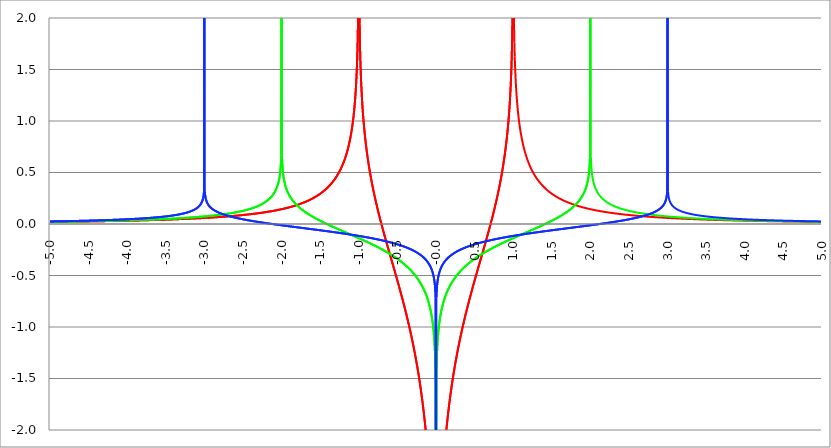
| Category | Series 1 | Series 0 | Series 2 |
|---|---|---|---|
| -5.0 | 0.02 | 0.022 | 0.025 |
| -4.995 | 0.02 | 0.022 | 0.025 |
| -4.99 | 0.02 | 0.022 | 0.025 |
| -4.985 | 0.021 | 0.022 | 0.025 |
| -4.98 | 0.021 | 0.022 | 0.025 |
| -4.975 | 0.021 | 0.022 | 0.025 |
| -4.97 | 0.021 | 0.022 | 0.025 |
| -4.965000000000001 | 0.021 | 0.022 | 0.025 |
| -4.960000000000001 | 0.021 | 0.022 | 0.025 |
| -4.955000000000001 | 0.021 | 0.022 | 0.025 |
| -4.950000000000001 | 0.021 | 0.022 | 0.025 |
| -4.945000000000001 | 0.021 | 0.022 | 0.025 |
| -4.940000000000001 | 0.021 | 0.022 | 0.026 |
| -4.935000000000001 | 0.021 | 0.022 | 0.026 |
| -4.930000000000001 | 0.021 | 0.022 | 0.026 |
| -4.925000000000002 | 0.021 | 0.023 | 0.026 |
| -4.920000000000002 | 0.021 | 0.023 | 0.026 |
| -4.915000000000002 | 0.021 | 0.023 | 0.026 |
| -4.910000000000002 | 0.021 | 0.023 | 0.026 |
| -4.905000000000002 | 0.021 | 0.023 | 0.026 |
| -4.900000000000002 | 0.021 | 0.023 | 0.026 |
| -4.895000000000002 | 0.021 | 0.023 | 0.026 |
| -4.890000000000002 | 0.021 | 0.023 | 0.026 |
| -4.885000000000002 | 0.021 | 0.023 | 0.026 |
| -4.880000000000002 | 0.021 | 0.023 | 0.026 |
| -4.875000000000003 | 0.021 | 0.023 | 0.026 |
| -4.870000000000003 | 0.022 | 0.023 | 0.027 |
| -4.865000000000003 | 0.022 | 0.023 | 0.027 |
| -4.860000000000003 | 0.022 | 0.023 | 0.027 |
| -4.855000000000003 | 0.022 | 0.023 | 0.027 |
| -4.850000000000003 | 0.022 | 0.023 | 0.027 |
| -4.845000000000003 | 0.022 | 0.023 | 0.027 |
| -4.840000000000003 | 0.022 | 0.023 | 0.027 |
| -4.835000000000003 | 0.022 | 0.023 | 0.027 |
| -4.830000000000004 | 0.022 | 0.024 | 0.027 |
| -4.825000000000004 | 0.022 | 0.024 | 0.027 |
| -4.820000000000004 | 0.022 | 0.024 | 0.027 |
| -4.815000000000004 | 0.022 | 0.024 | 0.027 |
| -4.810000000000004 | 0.022 | 0.024 | 0.027 |
| -4.805000000000004 | 0.022 | 0.024 | 0.027 |
| -4.800000000000004 | 0.022 | 0.024 | 0.028 |
| -4.795000000000004 | 0.022 | 0.024 | 0.028 |
| -4.790000000000004 | 0.022 | 0.024 | 0.028 |
| -4.785000000000004 | 0.022 | 0.024 | 0.028 |
| -4.780000000000004 | 0.022 | 0.024 | 0.028 |
| -4.775000000000004 | 0.022 | 0.024 | 0.028 |
| -4.770000000000004 | 0.022 | 0.024 | 0.028 |
| -4.765000000000005 | 0.023 | 0.024 | 0.028 |
| -4.760000000000005 | 0.023 | 0.024 | 0.028 |
| -4.755000000000005 | 0.023 | 0.024 | 0.028 |
| -4.750000000000005 | 0.023 | 0.024 | 0.028 |
| -4.745000000000005 | 0.023 | 0.024 | 0.028 |
| -4.740000000000005 | 0.023 | 0.025 | 0.028 |
| -4.735000000000005 | 0.023 | 0.025 | 0.029 |
| -4.730000000000005 | 0.023 | 0.025 | 0.029 |
| -4.725000000000006 | 0.023 | 0.025 | 0.029 |
| -4.720000000000006 | 0.023 | 0.025 | 0.029 |
| -4.715000000000006 | 0.023 | 0.025 | 0.029 |
| -4.710000000000006 | 0.023 | 0.025 | 0.029 |
| -4.705000000000006 | 0.023 | 0.025 | 0.029 |
| -4.700000000000006 | 0.023 | 0.025 | 0.029 |
| -4.695000000000006 | 0.023 | 0.025 | 0.029 |
| -4.690000000000006 | 0.023 | 0.025 | 0.029 |
| -4.685000000000007 | 0.023 | 0.025 | 0.029 |
| -4.680000000000007 | 0.023 | 0.025 | 0.029 |
| -4.675000000000007 | 0.023 | 0.025 | 0.029 |
| -4.670000000000007 | 0.023 | 0.025 | 0.03 |
| -4.665000000000007 | 0.024 | 0.025 | 0.03 |
| -4.660000000000007 | 0.024 | 0.025 | 0.03 |
| -4.655000000000007 | 0.024 | 0.026 | 0.03 |
| -4.650000000000007 | 0.024 | 0.026 | 0.03 |
| -4.645000000000007 | 0.024 | 0.026 | 0.03 |
| -4.640000000000008 | 0.024 | 0.026 | 0.03 |
| -4.635000000000008 | 0.024 | 0.026 | 0.03 |
| -4.630000000000008 | 0.024 | 0.026 | 0.03 |
| -4.625000000000008 | 0.024 | 0.026 | 0.03 |
| -4.620000000000008 | 0.024 | 0.026 | 0.03 |
| -4.615000000000008 | 0.024 | 0.026 | 0.031 |
| -4.610000000000008 | 0.024 | 0.026 | 0.031 |
| -4.605000000000008 | 0.024 | 0.026 | 0.031 |
| -4.600000000000008 | 0.024 | 0.026 | 0.031 |
| -4.595000000000009 | 0.024 | 0.026 | 0.031 |
| -4.590000000000009 | 0.024 | 0.026 | 0.031 |
| -4.585000000000009 | 0.024 | 0.026 | 0.031 |
| -4.580000000000009 | 0.024 | 0.026 | 0.031 |
| -4.57500000000001 | 0.024 | 0.027 | 0.031 |
| -4.57000000000001 | 0.025 | 0.027 | 0.031 |
| -4.565000000000009 | 0.025 | 0.027 | 0.031 |
| -4.560000000000009 | 0.025 | 0.027 | 0.032 |
| -4.555000000000009 | 0.025 | 0.027 | 0.032 |
| -4.55000000000001 | 0.025 | 0.027 | 0.032 |
| -4.54500000000001 | 0.025 | 0.027 | 0.032 |
| -4.54000000000001 | 0.025 | 0.027 | 0.032 |
| -4.53500000000001 | 0.025 | 0.027 | 0.032 |
| -4.53000000000001 | 0.025 | 0.027 | 0.032 |
| -4.52500000000001 | 0.025 | 0.027 | 0.032 |
| -4.52000000000001 | 0.025 | 0.027 | 0.032 |
| -4.51500000000001 | 0.025 | 0.027 | 0.032 |
| -4.51000000000001 | 0.025 | 0.027 | 0.032 |
| -4.505000000000011 | 0.025 | 0.027 | 0.033 |
| -4.500000000000011 | 0.025 | 0.028 | 0.033 |
| -4.495000000000011 | 0.025 | 0.028 | 0.033 |
| -4.490000000000011 | 0.025 | 0.028 | 0.033 |
| -4.485000000000011 | 0.025 | 0.028 | 0.033 |
| -4.480000000000011 | 0.026 | 0.028 | 0.033 |
| -4.475000000000011 | 0.026 | 0.028 | 0.033 |
| -4.470000000000011 | 0.026 | 0.028 | 0.033 |
| -4.465000000000011 | 0.026 | 0.028 | 0.033 |
| -4.460000000000011 | 0.026 | 0.028 | 0.033 |
| -4.455000000000012 | 0.026 | 0.028 | 0.034 |
| -4.450000000000012 | 0.026 | 0.028 | 0.034 |
| -4.445000000000012 | 0.026 | 0.028 | 0.034 |
| -4.440000000000012 | 0.026 | 0.028 | 0.034 |
| -4.435000000000012 | 0.026 | 0.028 | 0.034 |
| -4.430000000000012 | 0.026 | 0.028 | 0.034 |
| -4.425000000000012 | 0.026 | 0.029 | 0.034 |
| -4.420000000000012 | 0.026 | 0.029 | 0.034 |
| -4.415000000000012 | 0.026 | 0.029 | 0.034 |
| -4.410000000000013 | 0.026 | 0.029 | 0.035 |
| -4.405000000000013 | 0.026 | 0.029 | 0.035 |
| -4.400000000000013 | 0.027 | 0.029 | 0.035 |
| -4.395000000000013 | 0.027 | 0.029 | 0.035 |
| -4.390000000000013 | 0.027 | 0.029 | 0.035 |
| -4.385000000000013 | 0.027 | 0.029 | 0.035 |
| -4.380000000000013 | 0.027 | 0.029 | 0.035 |
| -4.375000000000013 | 0.027 | 0.029 | 0.035 |
| -4.370000000000013 | 0.027 | 0.029 | 0.035 |
| -4.365000000000013 | 0.027 | 0.029 | 0.036 |
| -4.360000000000014 | 0.027 | 0.03 | 0.036 |
| -4.355000000000014 | 0.027 | 0.03 | 0.036 |
| -4.350000000000014 | 0.027 | 0.03 | 0.036 |
| -4.345000000000014 | 0.027 | 0.03 | 0.036 |
| -4.340000000000014 | 0.027 | 0.03 | 0.036 |
| -4.335000000000014 | 0.027 | 0.03 | 0.036 |
| -4.330000000000014 | 0.027 | 0.03 | 0.036 |
| -4.325000000000014 | 0.027 | 0.03 | 0.036 |
| -4.320000000000014 | 0.028 | 0.03 | 0.037 |
| -4.315000000000015 | 0.028 | 0.03 | 0.037 |
| -4.310000000000015 | 0.028 | 0.03 | 0.037 |
| -4.305000000000015 | 0.028 | 0.03 | 0.037 |
| -4.300000000000015 | 0.028 | 0.03 | 0.037 |
| -4.295000000000015 | 0.028 | 0.031 | 0.037 |
| -4.290000000000015 | 0.028 | 0.031 | 0.037 |
| -4.285000000000015 | 0.028 | 0.031 | 0.037 |
| -4.280000000000015 | 0.028 | 0.031 | 0.038 |
| -4.275000000000015 | 0.028 | 0.031 | 0.038 |
| -4.270000000000015 | 0.028 | 0.031 | 0.038 |
| -4.265000000000016 | 0.028 | 0.031 | 0.038 |
| -4.260000000000016 | 0.028 | 0.031 | 0.038 |
| -4.255000000000016 | 0.028 | 0.031 | 0.038 |
| -4.250000000000016 | 0.028 | 0.031 | 0.038 |
| -4.245000000000016 | 0.029 | 0.031 | 0.038 |
| -4.240000000000016 | 0.029 | 0.031 | 0.039 |
| -4.235000000000016 | 0.029 | 0.032 | 0.039 |
| -4.230000000000016 | 0.029 | 0.032 | 0.039 |
| -4.225000000000017 | 0.029 | 0.032 | 0.039 |
| -4.220000000000017 | 0.029 | 0.032 | 0.039 |
| -4.215000000000017 | 0.029 | 0.032 | 0.039 |
| -4.210000000000017 | 0.029 | 0.032 | 0.039 |
| -4.205000000000017 | 0.029 | 0.032 | 0.04 |
| -4.200000000000017 | 0.029 | 0.032 | 0.04 |
| -4.195000000000017 | 0.029 | 0.032 | 0.04 |
| -4.190000000000017 | 0.029 | 0.032 | 0.04 |
| -4.185000000000017 | 0.029 | 0.032 | 0.04 |
| -4.180000000000017 | 0.029 | 0.032 | 0.04 |
| -4.175000000000018 | 0.03 | 0.033 | 0.04 |
| -4.170000000000018 | 0.03 | 0.033 | 0.04 |
| -4.165000000000018 | 0.03 | 0.033 | 0.041 |
| -4.160000000000018 | 0.03 | 0.033 | 0.041 |
| -4.155000000000018 | 0.03 | 0.033 | 0.041 |
| -4.150000000000018 | 0.03 | 0.033 | 0.041 |
| -4.145000000000018 | 0.03 | 0.033 | 0.041 |
| -4.140000000000018 | 0.03 | 0.033 | 0.041 |
| -4.135000000000018 | 0.03 | 0.033 | 0.042 |
| -4.130000000000019 | 0.03 | 0.033 | 0.042 |
| -4.125000000000019 | 0.03 | 0.033 | 0.042 |
| -4.120000000000019 | 0.03 | 0.034 | 0.042 |
| -4.115000000000019 | 0.03 | 0.034 | 0.042 |
| -4.110000000000019 | 0.031 | 0.034 | 0.042 |
| -4.105000000000019 | 0.031 | 0.034 | 0.042 |
| -4.100000000000019 | 0.031 | 0.034 | 0.043 |
| -4.095000000000019 | 0.031 | 0.034 | 0.043 |
| -4.090000000000019 | 0.031 | 0.034 | 0.043 |
| -4.085000000000019 | 0.031 | 0.034 | 0.043 |
| -4.08000000000002 | 0.031 | 0.034 | 0.043 |
| -4.07500000000002 | 0.031 | 0.034 | 0.043 |
| -4.07000000000002 | 0.031 | 0.035 | 0.044 |
| -4.06500000000002 | 0.031 | 0.035 | 0.044 |
| -4.06000000000002 | 0.031 | 0.035 | 0.044 |
| -4.05500000000002 | 0.031 | 0.035 | 0.044 |
| -4.05000000000002 | 0.031 | 0.035 | 0.044 |
| -4.04500000000002 | 0.032 | 0.035 | 0.044 |
| -4.04000000000002 | 0.032 | 0.035 | 0.045 |
| -4.03500000000002 | 0.032 | 0.035 | 0.045 |
| -4.03000000000002 | 0.032 | 0.035 | 0.045 |
| -4.025000000000021 | 0.032 | 0.035 | 0.045 |
| -4.020000000000021 | 0.032 | 0.036 | 0.045 |
| -4.015000000000021 | 0.032 | 0.036 | 0.045 |
| -4.010000000000021 | 0.032 | 0.036 | 0.046 |
| -4.005000000000021 | 0.032 | 0.036 | 0.046 |
| -4.000000000000021 | 0.032 | 0.036 | 0.046 |
| -3.995000000000021 | 0.032 | 0.036 | 0.046 |
| -3.990000000000021 | 0.032 | 0.036 | 0.046 |
| -3.985000000000022 | 0.033 | 0.036 | 0.046 |
| -3.980000000000022 | 0.033 | 0.036 | 0.047 |
| -3.975000000000022 | 0.033 | 0.036 | 0.047 |
| -3.970000000000022 | 0.033 | 0.037 | 0.047 |
| -3.965000000000022 | 0.033 | 0.037 | 0.047 |
| -3.960000000000022 | 0.033 | 0.037 | 0.047 |
| -3.955000000000022 | 0.033 | 0.037 | 0.048 |
| -3.950000000000022 | 0.033 | 0.037 | 0.048 |
| -3.945000000000022 | 0.033 | 0.037 | 0.048 |
| -3.940000000000023 | 0.033 | 0.037 | 0.048 |
| -3.935000000000023 | 0.033 | 0.037 | 0.048 |
| -3.930000000000023 | 0.033 | 0.037 | 0.049 |
| -3.925000000000023 | 0.034 | 0.038 | 0.049 |
| -3.920000000000023 | 0.034 | 0.038 | 0.049 |
| -3.915000000000023 | 0.034 | 0.038 | 0.049 |
| -3.910000000000023 | 0.034 | 0.038 | 0.049 |
| -3.905000000000023 | 0.034 | 0.038 | 0.05 |
| -3.900000000000023 | 0.034 | 0.038 | 0.05 |
| -3.895000000000023 | 0.034 | 0.038 | 0.05 |
| -3.890000000000024 | 0.034 | 0.038 | 0.05 |
| -3.885000000000024 | 0.034 | 0.038 | 0.05 |
| -3.880000000000024 | 0.034 | 0.039 | 0.051 |
| -3.875000000000024 | 0.034 | 0.039 | 0.051 |
| -3.870000000000024 | 0.035 | 0.039 | 0.051 |
| -3.865000000000024 | 0.035 | 0.039 | 0.051 |
| -3.860000000000024 | 0.035 | 0.039 | 0.051 |
| -3.855000000000024 | 0.035 | 0.039 | 0.052 |
| -3.850000000000024 | 0.035 | 0.039 | 0.052 |
| -3.845000000000025 | 0.035 | 0.039 | 0.052 |
| -3.840000000000025 | 0.035 | 0.04 | 0.052 |
| -3.835000000000025 | 0.035 | 0.04 | 0.053 |
| -3.830000000000025 | 0.035 | 0.04 | 0.053 |
| -3.825000000000025 | 0.035 | 0.04 | 0.053 |
| -3.820000000000025 | 0.035 | 0.04 | 0.053 |
| -3.815000000000025 | 0.036 | 0.04 | 0.054 |
| -3.810000000000025 | 0.036 | 0.04 | 0.054 |
| -3.805000000000025 | 0.036 | 0.04 | 0.054 |
| -3.800000000000026 | 0.036 | 0.041 | 0.054 |
| -3.795000000000026 | 0.036 | 0.041 | 0.054 |
| -3.790000000000026 | 0.036 | 0.041 | 0.055 |
| -3.785000000000026 | 0.036 | 0.041 | 0.055 |
| -3.780000000000026 | 0.036 | 0.041 | 0.055 |
| -3.775000000000026 | 0.036 | 0.041 | 0.055 |
| -3.770000000000026 | 0.036 | 0.041 | 0.056 |
| -3.765000000000026 | 0.037 | 0.041 | 0.056 |
| -3.760000000000026 | 0.037 | 0.042 | 0.056 |
| -3.755000000000026 | 0.037 | 0.042 | 0.056 |
| -3.750000000000027 | 0.037 | 0.042 | 0.057 |
| -3.745000000000027 | 0.037 | 0.042 | 0.057 |
| -3.740000000000027 | 0.037 | 0.042 | 0.057 |
| -3.735000000000027 | 0.037 | 0.042 | 0.058 |
| -3.730000000000027 | 0.037 | 0.042 | 0.058 |
| -3.725000000000027 | 0.037 | 0.043 | 0.058 |
| -3.720000000000027 | 0.038 | 0.043 | 0.058 |
| -3.715000000000027 | 0.038 | 0.043 | 0.059 |
| -3.710000000000027 | 0.038 | 0.043 | 0.059 |
| -3.705000000000028 | 0.038 | 0.043 | 0.059 |
| -3.700000000000028 | 0.038 | 0.043 | 0.06 |
| -3.695000000000028 | 0.038 | 0.043 | 0.06 |
| -3.690000000000028 | 0.038 | 0.043 | 0.06 |
| -3.685000000000028 | 0.038 | 0.044 | 0.06 |
| -3.680000000000028 | 0.038 | 0.044 | 0.061 |
| -3.675000000000028 | 0.038 | 0.044 | 0.061 |
| -3.670000000000028 | 0.039 | 0.044 | 0.061 |
| -3.665000000000028 | 0.039 | 0.044 | 0.062 |
| -3.660000000000028 | 0.039 | 0.044 | 0.062 |
| -3.655000000000029 | 0.039 | 0.044 | 0.062 |
| -3.650000000000029 | 0.039 | 0.045 | 0.063 |
| -3.645000000000029 | 0.039 | 0.045 | 0.063 |
| -3.640000000000029 | 0.039 | 0.045 | 0.063 |
| -3.635000000000029 | 0.039 | 0.045 | 0.063 |
| -3.630000000000029 | 0.039 | 0.045 | 0.064 |
| -3.625000000000029 | 0.04 | 0.045 | 0.064 |
| -3.620000000000029 | 0.04 | 0.046 | 0.064 |
| -3.615000000000029 | 0.04 | 0.046 | 0.065 |
| -3.61000000000003 | 0.04 | 0.046 | 0.065 |
| -3.60500000000003 | 0.04 | 0.046 | 0.066 |
| -3.60000000000003 | 0.04 | 0.046 | 0.066 |
| -3.59500000000003 | 0.04 | 0.046 | 0.066 |
| -3.59000000000003 | 0.04 | 0.046 | 0.067 |
| -3.58500000000003 | 0.041 | 0.047 | 0.067 |
| -3.58000000000003 | 0.041 | 0.047 | 0.067 |
| -3.57500000000003 | 0.041 | 0.047 | 0.068 |
| -3.57000000000003 | 0.041 | 0.047 | 0.068 |
| -3.565000000000031 | 0.041 | 0.047 | 0.068 |
| -3.560000000000031 | 0.041 | 0.047 | 0.069 |
| -3.555000000000031 | 0.041 | 0.048 | 0.069 |
| -3.550000000000031 | 0.041 | 0.048 | 0.07 |
| -3.545000000000031 | 0.041 | 0.048 | 0.07 |
| -3.540000000000031 | 0.042 | 0.048 | 0.07 |
| -3.535000000000031 | 0.042 | 0.048 | 0.071 |
| -3.530000000000031 | 0.042 | 0.048 | 0.071 |
| -3.525000000000031 | 0.042 | 0.049 | 0.072 |
| -3.520000000000032 | 0.042 | 0.049 | 0.072 |
| -3.515000000000032 | 0.042 | 0.049 | 0.072 |
| -3.510000000000032 | 0.042 | 0.049 | 0.073 |
| -3.505000000000032 | 0.042 | 0.049 | 0.073 |
| -3.500000000000032 | 0.043 | 0.049 | 0.074 |
| -3.495000000000032 | 0.043 | 0.05 | 0.074 |
| -3.490000000000032 | 0.043 | 0.05 | 0.075 |
| -3.485000000000032 | 0.043 | 0.05 | 0.075 |
| -3.480000000000032 | 0.043 | 0.05 | 0.076 |
| -3.475000000000032 | 0.043 | 0.05 | 0.076 |
| -3.470000000000033 | 0.043 | 0.05 | 0.076 |
| -3.465000000000033 | 0.043 | 0.051 | 0.077 |
| -3.460000000000033 | 0.044 | 0.051 | 0.077 |
| -3.455000000000033 | 0.044 | 0.051 | 0.078 |
| -3.450000000000033 | 0.044 | 0.051 | 0.078 |
| -3.445000000000033 | 0.044 | 0.051 | 0.079 |
| -3.440000000000033 | 0.044 | 0.052 | 0.079 |
| -3.435000000000033 | 0.044 | 0.052 | 0.08 |
| -3.430000000000033 | 0.044 | 0.052 | 0.08 |
| -3.425000000000034 | 0.045 | 0.052 | 0.081 |
| -3.420000000000034 | 0.045 | 0.052 | 0.082 |
| -3.415000000000034 | 0.045 | 0.053 | 0.082 |
| -3.410000000000034 | 0.045 | 0.053 | 0.083 |
| -3.405000000000034 | 0.045 | 0.053 | 0.083 |
| -3.400000000000034 | 0.045 | 0.053 | 0.084 |
| -3.395000000000034 | 0.045 | 0.053 | 0.084 |
| -3.390000000000034 | 0.046 | 0.053 | 0.085 |
| -3.385000000000034 | 0.046 | 0.054 | 0.086 |
| -3.380000000000034 | 0.046 | 0.054 | 0.086 |
| -3.375000000000035 | 0.046 | 0.054 | 0.087 |
| -3.370000000000035 | 0.046 | 0.054 | 0.087 |
| -3.365000000000035 | 0.046 | 0.054 | 0.088 |
| -3.360000000000035 | 0.046 | 0.055 | 0.089 |
| -3.355000000000035 | 0.047 | 0.055 | 0.089 |
| -3.350000000000035 | 0.047 | 0.055 | 0.09 |
| -3.345000000000035 | 0.047 | 0.055 | 0.091 |
| -3.340000000000035 | 0.047 | 0.056 | 0.091 |
| -3.335000000000035 | 0.047 | 0.056 | 0.092 |
| -3.330000000000036 | 0.047 | 0.056 | 0.093 |
| -3.325000000000036 | 0.047 | 0.056 | 0.093 |
| -3.320000000000036 | 0.048 | 0.056 | 0.094 |
| -3.315000000000036 | 0.048 | 0.057 | 0.095 |
| -3.310000000000036 | 0.048 | 0.057 | 0.096 |
| -3.305000000000036 | 0.048 | 0.057 | 0.096 |
| -3.300000000000036 | 0.048 | 0.057 | 0.097 |
| -3.295000000000036 | 0.048 | 0.057 | 0.098 |
| -3.290000000000036 | 0.048 | 0.058 | 0.099 |
| -3.285000000000036 | 0.049 | 0.058 | 0.1 |
| -3.280000000000036 | 0.049 | 0.058 | 0.101 |
| -3.275000000000037 | 0.049 | 0.058 | 0.102 |
| -3.270000000000037 | 0.049 | 0.059 | 0.102 |
| -3.265000000000037 | 0.049 | 0.059 | 0.103 |
| -3.260000000000037 | 0.049 | 0.059 | 0.104 |
| -3.255000000000037 | 0.05 | 0.059 | 0.105 |
| -3.250000000000037 | 0.05 | 0.059 | 0.106 |
| -3.245000000000037 | 0.05 | 0.06 | 0.107 |
| -3.240000000000037 | 0.05 | 0.06 | 0.108 |
| -3.235000000000038 | 0.05 | 0.06 | 0.109 |
| -3.230000000000038 | 0.05 | 0.06 | 0.11 |
| -3.225000000000038 | 0.051 | 0.061 | 0.111 |
| -3.220000000000038 | 0.051 | 0.061 | 0.113 |
| -3.215000000000038 | 0.051 | 0.061 | 0.114 |
| -3.210000000000038 | 0.051 | 0.061 | 0.115 |
| -3.205000000000038 | 0.051 | 0.062 | 0.116 |
| -3.200000000000038 | 0.051 | 0.062 | 0.117 |
| -3.195000000000038 | 0.052 | 0.062 | 0.119 |
| -3.190000000000039 | 0.052 | 0.062 | 0.12 |
| -3.185000000000039 | 0.052 | 0.063 | 0.121 |
| -3.180000000000039 | 0.052 | 0.063 | 0.123 |
| -3.175000000000039 | 0.052 | 0.063 | 0.124 |
| -3.170000000000039 | 0.052 | 0.063 | 0.126 |
| -3.16500000000004 | 0.053 | 0.064 | 0.127 |
| -3.16000000000004 | 0.053 | 0.064 | 0.129 |
| -3.155000000000039 | 0.053 | 0.064 | 0.13 |
| -3.150000000000039 | 0.053 | 0.065 | 0.132 |
| -3.14500000000004 | 0.053 | 0.065 | 0.134 |
| -3.14000000000004 | 0.053 | 0.065 | 0.136 |
| -3.13500000000004 | 0.054 | 0.065 | 0.137 |
| -3.13000000000004 | 0.054 | 0.066 | 0.139 |
| -3.12500000000004 | 0.054 | 0.066 | 0.141 |
| -3.12000000000004 | 0.054 | 0.066 | 0.144 |
| -3.11500000000004 | 0.054 | 0.066 | 0.146 |
| -3.11000000000004 | 0.055 | 0.067 | 0.148 |
| -3.10500000000004 | 0.055 | 0.067 | 0.151 |
| -3.10000000000004 | 0.055 | 0.067 | 0.153 |
| -3.095000000000041 | 0.055 | 0.068 | 0.156 |
| -3.090000000000041 | 0.055 | 0.068 | 0.159 |
| -3.085000000000041 | 0.056 | 0.068 | 0.162 |
| -3.080000000000041 | 0.056 | 0.068 | 0.165 |
| -3.075000000000041 | 0.056 | 0.069 | 0.168 |
| -3.070000000000041 | 0.056 | 0.069 | 0.172 |
| -3.065000000000041 | 0.056 | 0.069 | 0.176 |
| -3.060000000000041 | 0.056 | 0.07 | 0.18 |
| -3.055000000000041 | 0.057 | 0.07 | 0.185 |
| -3.050000000000042 | 0.057 | 0.07 | 0.19 |
| -3.045000000000042 | 0.057 | 0.071 | 0.196 |
| -3.040000000000042 | 0.057 | 0.071 | 0.202 |
| -3.035000000000042 | 0.057 | 0.071 | 0.21 |
| -3.030000000000042 | 0.058 | 0.072 | 0.218 |
| -3.025000000000042 | 0.058 | 0.072 | 0.228 |
| -3.020000000000042 | 0.058 | 0.072 | 0.24 |
| -3.015000000000042 | 0.058 | 0.072 | 0.256 |
| -3.010000000000042 | 0.058 | 0.073 | 0.279 |
| -3.005000000000043 | 0.059 | 0.073 | 0.317 |
| -3.000000000000043 | 0.059 | 0.073 | 5 |
| -2.995000000000043 | 0.059 | 0.074 | 0.317 |
| -2.990000000000043 | 0.059 | 0.074 | 0.278 |
| -2.985000000000043 | 0.06 | 0.074 | 0.255 |
| -2.980000000000043 | 0.06 | 0.075 | 0.239 |
| -2.975000000000043 | 0.06 | 0.075 | 0.227 |
| -2.970000000000043 | 0.06 | 0.076 | 0.216 |
| -2.965000000000043 | 0.06 | 0.076 | 0.208 |
| -2.960000000000043 | 0.061 | 0.076 | 0.2 |
| -2.955000000000044 | 0.061 | 0.077 | 0.194 |
| -2.950000000000044 | 0.061 | 0.077 | 0.188 |
| -2.945000000000044 | 0.061 | 0.077 | 0.182 |
| -2.940000000000044 | 0.061 | 0.078 | 0.177 |
| -2.935000000000044 | 0.062 | 0.078 | 0.173 |
| -2.930000000000044 | 0.062 | 0.078 | 0.168 |
| -2.925000000000044 | 0.062 | 0.079 | 0.164 |
| -2.920000000000044 | 0.062 | 0.079 | 0.161 |
| -2.915000000000044 | 0.063 | 0.08 | 0.157 |
| -2.910000000000045 | 0.063 | 0.08 | 0.154 |
| -2.905000000000045 | 0.063 | 0.08 | 0.151 |
| -2.900000000000045 | 0.063 | 0.081 | 0.148 |
| -2.895000000000045 | 0.064 | 0.081 | 0.145 |
| -2.890000000000045 | 0.064 | 0.081 | 0.142 |
| -2.885000000000045 | 0.064 | 0.082 | 0.139 |
| -2.880000000000045 | 0.064 | 0.082 | 0.137 |
| -2.875000000000045 | 0.064 | 0.083 | 0.134 |
| -2.870000000000045 | 0.065 | 0.083 | 0.132 |
| -2.865000000000045 | 0.065 | 0.084 | 0.13 |
| -2.860000000000046 | 0.065 | 0.084 | 0.128 |
| -2.855000000000046 | 0.065 | 0.084 | 0.126 |
| -2.850000000000046 | 0.066 | 0.085 | 0.124 |
| -2.845000000000046 | 0.066 | 0.085 | 0.122 |
| -2.840000000000046 | 0.066 | 0.086 | 0.12 |
| -2.835000000000046 | 0.066 | 0.086 | 0.118 |
| -2.830000000000046 | 0.067 | 0.087 | 0.116 |
| -2.825000000000046 | 0.067 | 0.087 | 0.114 |
| -2.820000000000046 | 0.067 | 0.087 | 0.113 |
| -2.815000000000047 | 0.067 | 0.088 | 0.111 |
| -2.810000000000047 | 0.068 | 0.088 | 0.109 |
| -2.805000000000047 | 0.068 | 0.089 | 0.108 |
| -2.800000000000047 | 0.068 | 0.089 | 0.106 |
| -2.795000000000047 | 0.068 | 0.09 | 0.105 |
| -2.790000000000047 | 0.069 | 0.09 | 0.103 |
| -2.785000000000047 | 0.069 | 0.091 | 0.102 |
| -2.780000000000047 | 0.069 | 0.091 | 0.1 |
| -2.775000000000047 | 0.07 | 0.092 | 0.099 |
| -2.770000000000047 | 0.07 | 0.092 | 0.097 |
| -2.765000000000048 | 0.07 | 0.093 | 0.096 |
| -2.760000000000048 | 0.07 | 0.093 | 0.095 |
| -2.755000000000048 | 0.071 | 0.094 | 0.094 |
| -2.750000000000048 | 0.071 | 0.094 | 0.092 |
| -2.745000000000048 | 0.071 | 0.095 | 0.091 |
| -2.740000000000048 | 0.071 | 0.095 | 0.09 |
| -2.735000000000048 | 0.072 | 0.096 | 0.089 |
| -2.730000000000048 | 0.072 | 0.096 | 0.087 |
| -2.725000000000048 | 0.072 | 0.097 | 0.086 |
| -2.720000000000049 | 0.073 | 0.097 | 0.085 |
| -2.715000000000049 | 0.073 | 0.098 | 0.084 |
| -2.710000000000049 | 0.073 | 0.098 | 0.083 |
| -2.705000000000049 | 0.073 | 0.099 | 0.082 |
| -2.700000000000049 | 0.074 | 0.099 | 0.081 |
| -2.695000000000049 | 0.074 | 0.1 | 0.079 |
| -2.690000000000049 | 0.074 | 0.101 | 0.078 |
| -2.685000000000049 | 0.075 | 0.101 | 0.077 |
| -2.680000000000049 | 0.075 | 0.102 | 0.076 |
| -2.675000000000049 | 0.075 | 0.102 | 0.075 |
| -2.67000000000005 | 0.076 | 0.103 | 0.074 |
| -2.66500000000005 | 0.076 | 0.104 | 0.073 |
| -2.66000000000005 | 0.076 | 0.104 | 0.072 |
| -2.65500000000005 | 0.076 | 0.105 | 0.071 |
| -2.65000000000005 | 0.077 | 0.105 | 0.07 |
| -2.64500000000005 | 0.077 | 0.106 | 0.069 |
| -2.64000000000005 | 0.077 | 0.107 | 0.069 |
| -2.63500000000005 | 0.078 | 0.107 | 0.068 |
| -2.63000000000005 | 0.078 | 0.108 | 0.067 |
| -2.625000000000051 | 0.078 | 0.109 | 0.066 |
| -2.620000000000051 | 0.079 | 0.109 | 0.065 |
| -2.615000000000051 | 0.079 | 0.11 | 0.064 |
| -2.610000000000051 | 0.079 | 0.111 | 0.063 |
| -2.605000000000051 | 0.08 | 0.111 | 0.062 |
| -2.600000000000051 | 0.08 | 0.112 | 0.061 |
| -2.595000000000051 | 0.08 | 0.113 | 0.061 |
| -2.590000000000051 | 0.081 | 0.113 | 0.06 |
| -2.585000000000051 | 0.081 | 0.114 | 0.059 |
| -2.580000000000052 | 0.081 | 0.115 | 0.058 |
| -2.575000000000052 | 0.082 | 0.116 | 0.057 |
| -2.570000000000052 | 0.082 | 0.116 | 0.056 |
| -2.565000000000052 | 0.082 | 0.117 | 0.056 |
| -2.560000000000052 | 0.083 | 0.118 | 0.055 |
| -2.555000000000052 | 0.083 | 0.119 | 0.054 |
| -2.550000000000052 | 0.083 | 0.119 | 0.053 |
| -2.545000000000052 | 0.084 | 0.12 | 0.052 |
| -2.540000000000052 | 0.084 | 0.121 | 0.052 |
| -2.535000000000053 | 0.085 | 0.122 | 0.051 |
| -2.530000000000053 | 0.085 | 0.123 | 0.05 |
| -2.525000000000053 | 0.085 | 0.123 | 0.049 |
| -2.520000000000053 | 0.086 | 0.124 | 0.049 |
| -2.515000000000053 | 0.086 | 0.125 | 0.048 |
| -2.510000000000053 | 0.086 | 0.126 | 0.047 |
| -2.505000000000053 | 0.087 | 0.127 | 0.046 |
| -2.500000000000053 | 0.087 | 0.128 | 0.046 |
| -2.495000000000053 | 0.088 | 0.129 | 0.045 |
| -2.490000000000053 | 0.088 | 0.13 | 0.044 |
| -2.485000000000054 | 0.088 | 0.13 | 0.043 |
| -2.480000000000054 | 0.089 | 0.131 | 0.043 |
| -2.475000000000054 | 0.089 | 0.132 | 0.042 |
| -2.470000000000054 | 0.09 | 0.133 | 0.041 |
| -2.465000000000054 | 0.09 | 0.134 | 0.041 |
| -2.460000000000054 | 0.09 | 0.135 | 0.04 |
| -2.455000000000054 | 0.091 | 0.136 | 0.039 |
| -2.450000000000054 | 0.091 | 0.137 | 0.039 |
| -2.445000000000054 | 0.092 | 0.138 | 0.038 |
| -2.440000000000055 | 0.092 | 0.139 | 0.037 |
| -2.435000000000055 | 0.092 | 0.14 | 0.037 |
| -2.430000000000055 | 0.093 | 0.141 | 0.036 |
| -2.425000000000055 | 0.093 | 0.143 | 0.035 |
| -2.420000000000055 | 0.094 | 0.144 | 0.035 |
| -2.415000000000055 | 0.094 | 0.145 | 0.034 |
| -2.410000000000055 | 0.094 | 0.146 | 0.033 |
| -2.405000000000055 | 0.095 | 0.147 | 0.033 |
| -2.400000000000055 | 0.095 | 0.148 | 0.032 |
| -2.395000000000055 | 0.096 | 0.149 | 0.031 |
| -2.390000000000056 | 0.096 | 0.151 | 0.031 |
| -2.385000000000056 | 0.097 | 0.152 | 0.03 |
| -2.380000000000056 | 0.097 | 0.153 | 0.029 |
| -2.375000000000056 | 0.098 | 0.154 | 0.029 |
| -2.370000000000056 | 0.098 | 0.156 | 0.028 |
| -2.365000000000056 | 0.098 | 0.157 | 0.028 |
| -2.360000000000056 | 0.099 | 0.158 | 0.027 |
| -2.355000000000056 | 0.099 | 0.16 | 0.026 |
| -2.350000000000056 | 0.1 | 0.161 | 0.026 |
| -2.345000000000057 | 0.1 | 0.162 | 0.025 |
| -2.340000000000057 | 0.101 | 0.164 | 0.024 |
| -2.335000000000057 | 0.101 | 0.165 | 0.024 |
| -2.330000000000057 | 0.102 | 0.167 | 0.023 |
| -2.325000000000057 | 0.102 | 0.168 | 0.023 |
| -2.320000000000057 | 0.103 | 0.17 | 0.022 |
| -2.315000000000057 | 0.103 | 0.171 | 0.021 |
| -2.310000000000057 | 0.104 | 0.173 | 0.021 |
| -2.305000000000057 | 0.104 | 0.175 | 0.02 |
| -2.300000000000058 | 0.105 | 0.176 | 0.02 |
| -2.295000000000058 | 0.105 | 0.178 | 0.019 |
| -2.290000000000058 | 0.106 | 0.18 | 0.019 |
| -2.285000000000058 | 0.106 | 0.182 | 0.018 |
| -2.280000000000058 | 0.107 | 0.183 | 0.017 |
| -2.275000000000058 | 0.107 | 0.185 | 0.017 |
| -2.270000000000058 | 0.108 | 0.187 | 0.016 |
| -2.265000000000058 | 0.108 | 0.189 | 0.016 |
| -2.260000000000058 | 0.109 | 0.191 | 0.015 |
| -2.255000000000058 | 0.109 | 0.193 | 0.015 |
| -2.250000000000059 | 0.11 | 0.195 | 0.014 |
| -2.245000000000059 | 0.111 | 0.197 | 0.013 |
| -2.240000000000059 | 0.111 | 0.199 | 0.013 |
| -2.235000000000059 | 0.112 | 0.202 | 0.012 |
| -2.23000000000006 | 0.112 | 0.204 | 0.012 |
| -2.22500000000006 | 0.113 | 0.206 | 0.011 |
| -2.22000000000006 | 0.113 | 0.209 | 0.011 |
| -2.215000000000059 | 0.114 | 0.211 | 0.01 |
| -2.210000000000059 | 0.115 | 0.214 | 0.01 |
| -2.20500000000006 | 0.115 | 0.216 | 0.009 |
| -2.20000000000006 | 0.116 | 0.219 | 0.008 |
| -2.19500000000006 | 0.116 | 0.222 | 0.008 |
| -2.19000000000006 | 0.117 | 0.224 | 0.007 |
| -2.18500000000006 | 0.118 | 0.227 | 0.007 |
| -2.18000000000006 | 0.118 | 0.23 | 0.006 |
| -2.17500000000006 | 0.119 | 0.233 | 0.006 |
| -2.17000000000006 | 0.119 | 0.237 | 0.005 |
| -2.16500000000006 | 0.12 | 0.24 | 0.005 |
| -2.160000000000061 | 0.121 | 0.243 | 0.004 |
| -2.155000000000061 | 0.121 | 0.247 | 0.004 |
| -2.150000000000061 | 0.122 | 0.251 | 0.003 |
| -2.145000000000061 | 0.123 | 0.254 | 0.002 |
| -2.140000000000061 | 0.123 | 0.258 | 0.002 |
| -2.135000000000061 | 0.124 | 0.262 | 0.001 |
| -2.130000000000061 | 0.124 | 0.267 | 0.001 |
| -2.125000000000061 | 0.125 | 0.271 | 0 |
| -2.120000000000061 | 0.126 | 0.276 | 0 |
| -2.115000000000061 | 0.127 | 0.281 | -0.001 |
| -2.110000000000062 | 0.127 | 0.286 | -0.001 |
| -2.105000000000062 | 0.128 | 0.291 | -0.002 |
| -2.100000000000062 | 0.129 | 0.297 | -0.002 |
| -2.095000000000062 | 0.129 | 0.303 | -0.003 |
| -2.090000000000062 | 0.13 | 0.309 | -0.003 |
| -2.085000000000062 | 0.131 | 0.316 | -0.004 |
| -2.080000000000062 | 0.131 | 0.323 | -0.004 |
| -2.075000000000062 | 0.132 | 0.331 | -0.005 |
| -2.070000000000062 | 0.133 | 0.339 | -0.005 |
| -2.065000000000063 | 0.134 | 0.348 | -0.006 |
| -2.060000000000063 | 0.134 | 0.357 | -0.006 |
| -2.055000000000063 | 0.135 | 0.368 | -0.007 |
| -2.050000000000063 | 0.136 | 0.379 | -0.007 |
| -2.045000000000063 | 0.137 | 0.392 | -0.008 |
| -2.040000000000063 | 0.137 | 0.406 | -0.008 |
| -2.035000000000063 | 0.138 | 0.422 | -0.009 |
| -2.030000000000063 | 0.139 | 0.441 | -0.009 |
| -2.025000000000063 | 0.14 | 0.463 | -0.01 |
| -2.020000000000064 | 0.141 | 0.491 | -0.01 |
| -2.015000000000064 | 0.141 | 0.526 | -0.011 |
| -2.010000000000064 | 0.142 | 0.577 | -0.011 |
| -2.005000000000064 | 0.143 | 0.663 | -0.012 |
| -2.000000000000064 | 0.144 | 3.798 | -0.012 |
| -1.995000000000064 | 0.145 | 0.662 | -0.013 |
| -1.990000000000064 | 0.146 | 0.575 | -0.013 |
| -1.985000000000064 | 0.146 | 0.524 | -0.014 |
| -1.980000000000064 | 0.147 | 0.487 | -0.014 |
| -1.975000000000064 | 0.148 | 0.459 | -0.015 |
| -1.970000000000065 | 0.149 | 0.435 | -0.015 |
| -1.965000000000065 | 0.15 | 0.416 | -0.016 |
| -1.960000000000065 | 0.151 | 0.399 | -0.016 |
| -1.955000000000065 | 0.152 | 0.383 | -0.017 |
| -1.950000000000065 | 0.153 | 0.37 | -0.017 |
| -1.945000000000065 | 0.153 | 0.357 | -0.018 |
| -1.940000000000065 | 0.154 | 0.346 | -0.018 |
| -1.935000000000065 | 0.155 | 0.335 | -0.019 |
| -1.930000000000065 | 0.156 | 0.326 | -0.019 |
| -1.925000000000066 | 0.157 | 0.317 | -0.02 |
| -1.920000000000066 | 0.158 | 0.308 | -0.02 |
| -1.915000000000066 | 0.159 | 0.3 | -0.021 |
| -1.910000000000066 | 0.16 | 0.292 | -0.021 |
| -1.905000000000066 | 0.161 | 0.285 | -0.022 |
| -1.900000000000066 | 0.162 | 0.278 | -0.022 |
| -1.895000000000066 | 0.163 | 0.272 | -0.023 |
| -1.890000000000066 | 0.164 | 0.265 | -0.023 |
| -1.885000000000066 | 0.165 | 0.259 | -0.024 |
| -1.880000000000066 | 0.166 | 0.253 | -0.024 |
| -1.875000000000067 | 0.167 | 0.248 | -0.025 |
| -1.870000000000067 | 0.168 | 0.242 | -0.025 |
| -1.865000000000067 | 0.169 | 0.237 | -0.026 |
| -1.860000000000067 | 0.171 | 0.232 | -0.026 |
| -1.855000000000067 | 0.172 | 0.227 | -0.027 |
| -1.850000000000067 | 0.173 | 0.222 | -0.027 |
| -1.845000000000067 | 0.174 | 0.218 | -0.028 |
| -1.840000000000067 | 0.175 | 0.213 | -0.028 |
| -1.835000000000067 | 0.176 | 0.209 | -0.029 |
| -1.830000000000068 | 0.177 | 0.205 | -0.029 |
| -1.825000000000068 | 0.179 | 0.201 | -0.03 |
| -1.820000000000068 | 0.18 | 0.197 | -0.03 |
| -1.815000000000068 | 0.181 | 0.193 | -0.031 |
| -1.810000000000068 | 0.182 | 0.189 | -0.031 |
| -1.805000000000068 | 0.183 | 0.185 | -0.031 |
| -1.800000000000068 | 0.185 | 0.181 | -0.032 |
| -1.795000000000068 | 0.186 | 0.178 | -0.032 |
| -1.790000000000068 | 0.187 | 0.174 | -0.033 |
| -1.785000000000068 | 0.188 | 0.171 | -0.033 |
| -1.780000000000069 | 0.19 | 0.167 | -0.034 |
| -1.775000000000069 | 0.191 | 0.164 | -0.034 |
| -1.770000000000069 | 0.192 | 0.161 | -0.035 |
| -1.765000000000069 | 0.194 | 0.157 | -0.035 |
| -1.760000000000069 | 0.195 | 0.154 | -0.036 |
| -1.75500000000007 | 0.196 | 0.151 | -0.036 |
| -1.75000000000007 | 0.198 | 0.148 | -0.037 |
| -1.745000000000069 | 0.199 | 0.145 | -0.037 |
| -1.740000000000069 | 0.2 | 0.142 | -0.038 |
| -1.73500000000007 | 0.202 | 0.139 | -0.038 |
| -1.73000000000007 | 0.203 | 0.136 | -0.039 |
| -1.72500000000007 | 0.205 | 0.133 | -0.039 |
| -1.72000000000007 | 0.206 | 0.13 | -0.04 |
| -1.71500000000007 | 0.208 | 0.128 | -0.04 |
| -1.71000000000007 | 0.209 | 0.125 | -0.041 |
| -1.70500000000007 | 0.211 | 0.122 | -0.041 |
| -1.70000000000007 | 0.212 | 0.12 | -0.042 |
| -1.69500000000007 | 0.214 | 0.117 | -0.042 |
| -1.69000000000007 | 0.215 | 0.114 | -0.043 |
| -1.685000000000071 | 0.217 | 0.112 | -0.043 |
| -1.680000000000071 | 0.219 | 0.109 | -0.044 |
| -1.675000000000071 | 0.22 | 0.107 | -0.044 |
| -1.670000000000071 | 0.222 | 0.104 | -0.044 |
| -1.665000000000071 | 0.224 | 0.102 | -0.045 |
| -1.660000000000071 | 0.225 | 0.099 | -0.045 |
| -1.655000000000071 | 0.227 | 0.097 | -0.046 |
| -1.650000000000071 | 0.229 | 0.095 | -0.046 |
| -1.645000000000071 | 0.231 | 0.092 | -0.047 |
| -1.640000000000072 | 0.232 | 0.09 | -0.047 |
| -1.635000000000072 | 0.234 | 0.088 | -0.048 |
| -1.630000000000072 | 0.236 | 0.085 | -0.048 |
| -1.625000000000072 | 0.238 | 0.083 | -0.049 |
| -1.620000000000072 | 0.24 | 0.081 | -0.049 |
| -1.615000000000072 | 0.242 | 0.079 | -0.05 |
| -1.610000000000072 | 0.244 | 0.076 | -0.05 |
| -1.605000000000072 | 0.246 | 0.074 | -0.051 |
| -1.600000000000072 | 0.248 | 0.072 | -0.051 |
| -1.595000000000073 | 0.25 | 0.07 | -0.052 |
| -1.590000000000073 | 0.252 | 0.068 | -0.052 |
| -1.585000000000073 | 0.254 | 0.065 | -0.053 |
| -1.580000000000073 | 0.256 | 0.063 | -0.053 |
| -1.575000000000073 | 0.258 | 0.061 | -0.054 |
| -1.570000000000073 | 0.26 | 0.059 | -0.054 |
| -1.565000000000073 | 0.262 | 0.057 | -0.055 |
| -1.560000000000073 | 0.265 | 0.055 | -0.055 |
| -1.555000000000073 | 0.267 | 0.053 | -0.056 |
| -1.550000000000074 | 0.269 | 0.051 | -0.056 |
| -1.545000000000074 | 0.271 | 0.049 | -0.057 |
| -1.540000000000074 | 0.274 | 0.047 | -0.057 |
| -1.535000000000074 | 0.276 | 0.045 | -0.058 |
| -1.530000000000074 | 0.279 | 0.043 | -0.058 |
| -1.525000000000074 | 0.281 | 0.041 | -0.059 |
| -1.520000000000074 | 0.284 | 0.039 | -0.059 |
| -1.515000000000074 | 0.286 | 0.037 | -0.06 |
| -1.510000000000074 | 0.289 | 0.035 | -0.06 |
| -1.505000000000074 | 0.291 | 0.033 | -0.061 |
| -1.500000000000075 | 0.294 | 0.031 | -0.061 |
| -1.495000000000075 | 0.297 | 0.03 | -0.062 |
| -1.490000000000075 | 0.299 | 0.028 | -0.062 |
| -1.485000000000075 | 0.302 | 0.026 | -0.063 |
| -1.480000000000075 | 0.305 | 0.024 | -0.063 |
| -1.475000000000075 | 0.308 | 0.022 | -0.064 |
| -1.470000000000075 | 0.311 | 0.02 | -0.064 |
| -1.465000000000075 | 0.314 | 0.018 | -0.065 |
| -1.460000000000075 | 0.317 | 0.016 | -0.065 |
| -1.455000000000076 | 0.32 | 0.015 | -0.066 |
| -1.450000000000076 | 0.323 | 0.013 | -0.066 |
| -1.445000000000076 | 0.326 | 0.011 | -0.067 |
| -1.440000000000076 | 0.329 | 0.009 | -0.067 |
| -1.435000000000076 | 0.332 | 0.007 | -0.068 |
| -1.430000000000076 | 0.336 | 0.006 | -0.068 |
| -1.425000000000076 | 0.339 | 0.004 | -0.069 |
| -1.420000000000076 | 0.343 | 0.002 | -0.069 |
| -1.415000000000076 | 0.346 | 0 | -0.07 |
| -1.410000000000077 | 0.35 | -0.001 | -0.07 |
| -1.405000000000077 | 0.353 | -0.003 | -0.071 |
| -1.400000000000077 | 0.357 | -0.005 | -0.071 |
| -1.395000000000077 | 0.361 | -0.007 | -0.072 |
| -1.390000000000077 | 0.364 | -0.008 | -0.072 |
| -1.385000000000077 | 0.368 | -0.01 | -0.073 |
| -1.380000000000077 | 0.372 | -0.012 | -0.073 |
| -1.375000000000077 | 0.376 | -0.014 | -0.074 |
| -1.370000000000077 | 0.38 | -0.015 | -0.074 |
| -1.365000000000077 | 0.385 | -0.017 | -0.075 |
| -1.360000000000078 | 0.389 | -0.019 | -0.075 |
| -1.355000000000078 | 0.393 | -0.021 | -0.076 |
| -1.350000000000078 | 0.398 | -0.022 | -0.076 |
| -1.345000000000078 | 0.402 | -0.024 | -0.077 |
| -1.340000000000078 | 0.407 | -0.026 | -0.077 |
| -1.335000000000078 | 0.412 | -0.027 | -0.078 |
| -1.330000000000078 | 0.417 | -0.029 | -0.078 |
| -1.325000000000078 | 0.422 | -0.031 | -0.079 |
| -1.320000000000078 | 0.427 | -0.032 | -0.079 |
| -1.315000000000079 | 0.432 | -0.034 | -0.08 |
| -1.310000000000079 | 0.437 | -0.036 | -0.08 |
| -1.305000000000079 | 0.442 | -0.037 | -0.081 |
| -1.300000000000079 | 0.448 | -0.039 | -0.081 |
| -1.295000000000079 | 0.454 | -0.041 | -0.082 |
| -1.29000000000008 | 0.459 | -0.042 | -0.082 |
| -1.285000000000079 | 0.465 | -0.044 | -0.083 |
| -1.280000000000079 | 0.471 | -0.046 | -0.083 |
| -1.275000000000079 | 0.477 | -0.047 | -0.084 |
| -1.270000000000079 | 0.484 | -0.049 | -0.085 |
| -1.26500000000008 | 0.49 | -0.051 | -0.085 |
| -1.26000000000008 | 0.497 | -0.052 | -0.086 |
| -1.25500000000008 | 0.504 | -0.054 | -0.086 |
| -1.25000000000008 | 0.511 | -0.056 | -0.087 |
| -1.24500000000008 | 0.518 | -0.057 | -0.087 |
| -1.24000000000008 | 0.525 | -0.059 | -0.088 |
| -1.23500000000008 | 0.533 | -0.061 | -0.088 |
| -1.23000000000008 | 0.541 | -0.062 | -0.089 |
| -1.22500000000008 | 0.549 | -0.064 | -0.089 |
| -1.220000000000081 | 0.557 | -0.065 | -0.09 |
| -1.215000000000081 | 0.566 | -0.067 | -0.09 |
| -1.210000000000081 | 0.574 | -0.069 | -0.091 |
| -1.205000000000081 | 0.583 | -0.07 | -0.092 |
| -1.200000000000081 | 0.593 | -0.072 | -0.092 |
| -1.195000000000081 | 0.602 | -0.074 | -0.093 |
| -1.190000000000081 | 0.612 | -0.075 | -0.093 |
| -1.185000000000081 | 0.623 | -0.077 | -0.094 |
| -1.180000000000081 | 0.633 | -0.078 | -0.094 |
| -1.175000000000082 | 0.644 | -0.08 | -0.095 |
| -1.170000000000082 | 0.656 | -0.082 | -0.095 |
| -1.165000000000082 | 0.667 | -0.083 | -0.096 |
| -1.160000000000082 | 0.68 | -0.085 | -0.097 |
| -1.155000000000082 | 0.692 | -0.087 | -0.097 |
| -1.150000000000082 | 0.706 | -0.088 | -0.098 |
| -1.145000000000082 | 0.719 | -0.09 | -0.098 |
| -1.140000000000082 | 0.734 | -0.091 | -0.099 |
| -1.135000000000082 | 0.749 | -0.093 | -0.099 |
| -1.130000000000082 | 0.764 | -0.095 | -0.1 |
| -1.125000000000083 | 0.781 | -0.096 | -0.101 |
| -1.120000000000083 | 0.798 | -0.098 | -0.101 |
| -1.115000000000083 | 0.816 | -0.1 | -0.102 |
| -1.110000000000083 | 0.835 | -0.101 | -0.102 |
| -1.105000000000083 | 0.855 | -0.103 | -0.103 |
| -1.100000000000083 | 0.876 | -0.104 | -0.103 |
| -1.095000000000083 | 0.898 | -0.106 | -0.104 |
| -1.090000000000083 | 0.922 | -0.108 | -0.105 |
| -1.085000000000083 | 0.947 | -0.109 | -0.105 |
| -1.080000000000084 | 0.974 | -0.111 | -0.106 |
| -1.075000000000084 | 1.002 | -0.113 | -0.106 |
| -1.070000000000084 | 1.034 | -0.114 | -0.107 |
| -1.065000000000084 | 1.067 | -0.116 | -0.108 |
| -1.060000000000084 | 1.104 | -0.118 | -0.108 |
| -1.055000000000084 | 1.144 | -0.119 | -0.109 |
| -1.050000000000084 | 1.188 | -0.121 | -0.109 |
| -1.045000000000084 | 1.237 | -0.122 | -0.11 |
| -1.040000000000084 | 1.292 | -0.124 | -0.111 |
| -1.035000000000085 | 1.355 | -0.126 | -0.111 |
| -1.030000000000085 | 1.429 | -0.127 | -0.112 |
| -1.025000000000085 | 1.516 | -0.129 | -0.112 |
| -1.020000000000085 | 1.624 | -0.131 | -0.113 |
| -1.015000000000085 | 1.764 | -0.132 | -0.114 |
| -1.010000000000085 | 1.963 | -0.134 | -0.114 |
| -1.005000000000085 | 2.306 | -0.136 | -0.115 |
| -1.000000000000085 | 14.7 | -0.137 | -0.116 |
| -0.995000000000085 | 2.299 | -0.139 | -0.116 |
| -0.990000000000085 | 1.948 | -0.141 | -0.117 |
| -0.985000000000085 | 1.742 | -0.142 | -0.117 |
| -0.980000000000085 | 1.594 | -0.144 | -0.118 |
| -0.975000000000085 | 1.479 | -0.146 | -0.119 |
| -0.970000000000085 | 1.384 | -0.147 | -0.119 |
| -0.965000000000085 | 1.303 | -0.149 | -0.12 |
| -0.960000000000085 | 1.232 | -0.151 | -0.121 |
| -0.955000000000085 | 1.169 | -0.152 | -0.121 |
| -0.950000000000085 | 1.113 | -0.154 | -0.122 |
| -0.945000000000085 | 1.061 | -0.156 | -0.123 |
| -0.940000000000085 | 1.013 | -0.158 | -0.123 |
| -0.935000000000085 | 0.969 | -0.159 | -0.124 |
| -0.930000000000085 | 0.928 | -0.161 | -0.125 |
| -0.925000000000085 | 0.89 | -0.163 | -0.125 |
| -0.920000000000085 | 0.853 | -0.164 | -0.126 |
| -0.915000000000085 | 0.819 | -0.166 | -0.127 |
| -0.910000000000085 | 0.786 | -0.168 | -0.127 |
| -0.905000000000085 | 0.755 | -0.17 | -0.128 |
| -0.900000000000085 | 0.725 | -0.171 | -0.129 |
| -0.895000000000085 | 0.696 | -0.173 | -0.129 |
| -0.890000000000085 | 0.669 | -0.175 | -0.13 |
| -0.885000000000085 | 0.642 | -0.177 | -0.131 |
| -0.880000000000085 | 0.617 | -0.178 | -0.131 |
| -0.875000000000085 | 0.592 | -0.18 | -0.132 |
| -0.870000000000085 | 0.568 | -0.182 | -0.133 |
| -0.865000000000085 | 0.545 | -0.184 | -0.133 |
| -0.860000000000085 | 0.522 | -0.185 | -0.134 |
| -0.855000000000085 | 0.5 | -0.187 | -0.135 |
| -0.850000000000085 | 0.478 | -0.189 | -0.135 |
| -0.845000000000085 | 0.458 | -0.191 | -0.136 |
| -0.840000000000085 | 0.437 | -0.193 | -0.137 |
| -0.835000000000085 | 0.417 | -0.194 | -0.138 |
| -0.830000000000085 | 0.397 | -0.196 | -0.138 |
| -0.825000000000085 | 0.378 | -0.198 | -0.139 |
| -0.820000000000085 | 0.36 | -0.2 | -0.14 |
| -0.815000000000085 | 0.341 | -0.202 | -0.141 |
| -0.810000000000085 | 0.323 | -0.204 | -0.141 |
| -0.805000000000085 | 0.305 | -0.205 | -0.142 |
| -0.800000000000085 | 0.288 | -0.207 | -0.143 |
| -0.795000000000085 | 0.27 | -0.209 | -0.144 |
| -0.790000000000085 | 0.253 | -0.211 | -0.144 |
| -0.785000000000085 | 0.237 | -0.213 | -0.145 |
| -0.780000000000085 | 0.22 | -0.215 | -0.146 |
| -0.775000000000085 | 0.204 | -0.217 | -0.147 |
| -0.770000000000085 | 0.188 | -0.219 | -0.147 |
| -0.765000000000085 | 0.172 | -0.22 | -0.148 |
| -0.760000000000085 | 0.156 | -0.222 | -0.149 |
| -0.755000000000085 | 0.141 | -0.224 | -0.15 |
| -0.750000000000085 | 0.126 | -0.226 | -0.15 |
| -0.745000000000085 | 0.11 | -0.228 | -0.151 |
| -0.740000000000085 | 0.095 | -0.23 | -0.152 |
| -0.735000000000085 | 0.081 | -0.232 | -0.153 |
| -0.730000000000085 | 0.066 | -0.234 | -0.154 |
| -0.725000000000085 | 0.051 | -0.236 | -0.154 |
| -0.720000000000085 | 0.037 | -0.238 | -0.155 |
| -0.715000000000085 | 0.022 | -0.24 | -0.156 |
| -0.710000000000085 | 0.008 | -0.242 | -0.157 |
| -0.705000000000085 | -0.006 | -0.244 | -0.158 |
| -0.700000000000085 | -0.02 | -0.246 | -0.159 |
| -0.695000000000085 | -0.034 | -0.248 | -0.159 |
| -0.690000000000085 | -0.048 | -0.25 | -0.16 |
| -0.685000000000085 | -0.062 | -0.252 | -0.161 |
| -0.680000000000085 | -0.075 | -0.254 | -0.162 |
| -0.675000000000085 | -0.089 | -0.256 | -0.163 |
| -0.670000000000085 | -0.103 | -0.259 | -0.164 |
| -0.665000000000085 | -0.116 | -0.261 | -0.165 |
| -0.660000000000085 | -0.13 | -0.263 | -0.165 |
| -0.655000000000085 | -0.143 | -0.265 | -0.166 |
| -0.650000000000085 | -0.156 | -0.267 | -0.167 |
| -0.645000000000085 | -0.17 | -0.269 | -0.168 |
| -0.640000000000085 | -0.183 | -0.271 | -0.169 |
| -0.635000000000085 | -0.196 | -0.274 | -0.17 |
| -0.630000000000085 | -0.209 | -0.276 | -0.171 |
| -0.625000000000085 | -0.222 | -0.278 | -0.172 |
| -0.620000000000085 | -0.235 | -0.28 | -0.173 |
| -0.615000000000085 | -0.249 | -0.282 | -0.174 |
| -0.610000000000085 | -0.262 | -0.285 | -0.175 |
| -0.605000000000085 | -0.275 | -0.287 | -0.176 |
| -0.600000000000085 | -0.288 | -0.289 | -0.177 |
| -0.595000000000085 | -0.301 | -0.292 | -0.178 |
| -0.590000000000085 | -0.314 | -0.294 | -0.179 |
| -0.585000000000085 | -0.327 | -0.296 | -0.179 |
| -0.580000000000085 | -0.34 | -0.298 | -0.18 |
| -0.575000000000085 | -0.353 | -0.301 | -0.181 |
| -0.570000000000085 | -0.366 | -0.303 | -0.182 |
| -0.565000000000085 | -0.379 | -0.306 | -0.183 |
| -0.560000000000085 | -0.392 | -0.308 | -0.185 |
| -0.555000000000085 | -0.405 | -0.31 | -0.186 |
| -0.550000000000085 | -0.418 | -0.313 | -0.187 |
| -0.545000000000085 | -0.431 | -0.315 | -0.188 |
| -0.540000000000085 | -0.444 | -0.318 | -0.189 |
| -0.535000000000085 | -0.457 | -0.32 | -0.19 |
| -0.530000000000085 | -0.47 | -0.323 | -0.191 |
| -0.525000000000085 | -0.483 | -0.325 | -0.192 |
| -0.520000000000085 | -0.496 | -0.328 | -0.193 |
| -0.515000000000085 | -0.509 | -0.331 | -0.194 |
| -0.510000000000085 | -0.523 | -0.333 | -0.195 |
| -0.505000000000085 | -0.536 | -0.336 | -0.196 |
| -0.500000000000085 | -0.549 | -0.339 | -0.198 |
| -0.495000000000085 | -0.563 | -0.341 | -0.199 |
| -0.490000000000085 | -0.576 | -0.344 | -0.2 |
| -0.485000000000085 | -0.59 | -0.347 | -0.201 |
| -0.480000000000085 | -0.603 | -0.349 | -0.202 |
| -0.475000000000085 | -0.617 | -0.352 | -0.203 |
| -0.470000000000085 | -0.63 | -0.355 | -0.205 |
| -0.465000000000085 | -0.644 | -0.358 | -0.206 |
| -0.460000000000085 | -0.658 | -0.361 | -0.207 |
| -0.455000000000085 | -0.671 | -0.364 | -0.208 |
| -0.450000000000085 | -0.685 | -0.366 | -0.21 |
| -0.445000000000085 | -0.699 | -0.369 | -0.211 |
| -0.440000000000085 | -0.713 | -0.372 | -0.212 |
| -0.435000000000085 | -0.728 | -0.375 | -0.213 |
| -0.430000000000085 | -0.742 | -0.378 | -0.215 |
| -0.425000000000085 | -0.756 | -0.381 | -0.216 |
| -0.420000000000085 | -0.77 | -0.385 | -0.217 |
| -0.415000000000085 | -0.785 | -0.388 | -0.219 |
| -0.410000000000085 | -0.8 | -0.391 | -0.22 |
| -0.405000000000085 | -0.814 | -0.394 | -0.221 |
| -0.400000000000085 | -0.829 | -0.397 | -0.223 |
| -0.395000000000085 | -0.844 | -0.401 | -0.224 |
| -0.390000000000085 | -0.859 | -0.404 | -0.226 |
| -0.385000000000085 | -0.874 | -0.407 | -0.227 |
| -0.380000000000085 | -0.89 | -0.411 | -0.229 |
| -0.375000000000085 | -0.905 | -0.414 | -0.23 |
| -0.370000000000085 | -0.921 | -0.417 | -0.232 |
| -0.365000000000085 | -0.936 | -0.421 | -0.233 |
| -0.360000000000085 | -0.952 | -0.425 | -0.235 |
| -0.355000000000085 | -0.968 | -0.428 | -0.236 |
| -0.350000000000085 | -0.984 | -0.432 | -0.238 |
| -0.345000000000085 | -1.001 | -0.436 | -0.24 |
| -0.340000000000085 | -1.017 | -0.439 | -0.241 |
| -0.335000000000085 | -1.034 | -0.443 | -0.243 |
| -0.330000000000085 | -1.051 | -0.447 | -0.245 |
| -0.325000000000085 | -1.068 | -0.451 | -0.246 |
| -0.320000000000085 | -1.085 | -0.455 | -0.248 |
| -0.315000000000085 | -1.103 | -0.459 | -0.25 |
| -0.310000000000085 | -1.121 | -0.463 | -0.252 |
| -0.305000000000085 | -1.139 | -0.467 | -0.253 |
| -0.300000000000085 | -1.157 | -0.471 | -0.255 |
| -0.295000000000085 | -1.175 | -0.476 | -0.257 |
| -0.290000000000085 | -1.194 | -0.48 | -0.259 |
| -0.285000000000085 | -1.213 | -0.485 | -0.261 |
| -0.280000000000085 | -1.232 | -0.489 | -0.263 |
| -0.275000000000085 | -1.252 | -0.494 | -0.265 |
| -0.270000000000085 | -1.271 | -0.498 | -0.267 |
| -0.265000000000085 | -1.292 | -0.503 | -0.269 |
| -0.260000000000085 | -1.312 | -0.508 | -0.271 |
| -0.255000000000085 | -1.333 | -0.513 | -0.273 |
| -0.250000000000085 | -1.354 | -0.518 | -0.276 |
| -0.245000000000085 | -1.376 | -0.523 | -0.278 |
| -0.240000000000085 | -1.397 | -0.528 | -0.28 |
| -0.235000000000085 | -1.42 | -0.534 | -0.283 |
| -0.230000000000085 | -1.443 | -0.539 | -0.285 |
| -0.225000000000085 | -1.466 | -0.545 | -0.287 |
| -0.220000000000085 | -1.489 | -0.55 | -0.29 |
| -0.215000000000085 | -1.513 | -0.556 | -0.293 |
| -0.210000000000085 | -1.538 | -0.562 | -0.295 |
| -0.205000000000085 | -1.563 | -0.568 | -0.298 |
| -0.200000000000085 | -1.589 | -0.574 | -0.301 |
| -0.195000000000085 | -1.615 | -0.581 | -0.303 |
| -0.190000000000085 | -1.642 | -0.587 | -0.306 |
| -0.185000000000085 | -1.67 | -0.594 | -0.309 |
| -0.180000000000085 | -1.698 | -0.601 | -0.312 |
| -0.175000000000085 | -1.727 | -0.608 | -0.316 |
| -0.170000000000085 | -1.757 | -0.615 | -0.319 |
| -0.165000000000085 | -1.788 | -0.623 | -0.322 |
| -0.160000000000085 | -1.82 | -0.631 | -0.326 |
| -0.155000000000084 | -1.852 | -0.639 | -0.329 |
| -0.150000000000084 | -1.886 | -0.647 | -0.333 |
| -0.145000000000084 | -1.92 | -0.655 | -0.336 |
| -0.140000000000084 | -1.956 | -0.664 | -0.34 |
| -0.135000000000084 | -1.993 | -0.673 | -0.344 |
| -0.130000000000084 | -2.032 | -0.683 | -0.349 |
| -0.125000000000084 | -2.072 | -0.693 | -0.353 |
| -0.120000000000084 | -2.113 | -0.703 | -0.358 |
| -0.115000000000084 | -2.156 | -0.714 | -0.362 |
| -0.110000000000084 | -2.201 | -0.725 | -0.367 |
| -0.105000000000084 | -2.248 | -0.736 | -0.372 |
| -0.100000000000084 | -2.298 | -0.749 | -0.378 |
| -0.0950000000000844 | -2.349 | -0.761 | -0.384 |
| -0.0900000000000844 | -2.404 | -0.775 | -0.39 |
| -0.0850000000000844 | -2.461 | -0.789 | -0.396 |
| -0.0800000000000844 | -2.523 | -0.805 | -0.403 |
| -0.0750000000000844 | -2.587 | -0.821 | -0.41 |
| -0.0700000000000844 | -2.657 | -0.838 | -0.418 |
| -0.0650000000000844 | -2.731 | -0.856 | -0.426 |
| -0.0600000000000844 | -2.812 | -0.877 | -0.435 |
| -0.0550000000000844 | -2.899 | -0.898 | -0.444 |
| -0.0500000000000844 | -2.994 | -0.922 | -0.455 |
| -0.0450000000000844 | -3.1 | -0.948 | -0.467 |
| -0.0400000000000844 | -3.218 | -0.978 | -0.48 |
| -0.0350000000000844 | -3.352 | -1.011 | -0.495 |
| -0.0300000000000844 | -3.506 | -1.05 | -0.512 |
| -0.0250000000000844 | -3.689 | -1.095 | -0.532 |
| -0.0200000000000844 | -3.912 | -1.151 | -0.557 |
| -0.0150000000000844 | -4.2 | -1.223 | -0.589 |
| -0.0100000000000844 | -4.605 | -1.325 | -0.634 |
| -0.00500000000008444 | -5.298 | -1.498 | -0.711 |
| -8.4444604087075e-14 | -30.103 | -7.699 | -3.467 |
| 0.00499999999991555 | -5.298 | -1.498 | -0.711 |
| 0.00999999999991555 | -4.605 | -1.325 | -0.634 |
| 0.0149999999999156 | -4.2 | -1.223 | -0.589 |
| 0.0199999999999156 | -3.912 | -1.151 | -0.557 |
| 0.0249999999999156 | -3.689 | -1.095 | -0.532 |
| 0.0299999999999156 | -3.506 | -1.05 | -0.512 |
| 0.0349999999999155 | -3.352 | -1.011 | -0.495 |
| 0.0399999999999155 | -3.218 | -0.978 | -0.48 |
| 0.0449999999999155 | -3.1 | -0.948 | -0.467 |
| 0.0499999999999155 | -2.994 | -0.922 | -0.455 |
| 0.0549999999999155 | -2.899 | -0.898 | -0.444 |
| 0.0599999999999155 | -2.812 | -0.877 | -0.435 |
| 0.0649999999999155 | -2.731 | -0.856 | -0.426 |
| 0.0699999999999155 | -2.657 | -0.838 | -0.418 |
| 0.0749999999999155 | -2.587 | -0.821 | -0.41 |
| 0.0799999999999155 | -2.523 | -0.805 | -0.403 |
| 0.0849999999999155 | -2.461 | -0.789 | -0.396 |
| 0.0899999999999155 | -2.404 | -0.775 | -0.39 |
| 0.0949999999999155 | -2.349 | -0.761 | -0.384 |
| 0.0999999999999155 | -2.298 | -0.749 | -0.378 |
| 0.104999999999916 | -2.248 | -0.736 | -0.372 |
| 0.109999999999916 | -2.201 | -0.725 | -0.367 |
| 0.114999999999916 | -2.156 | -0.714 | -0.362 |
| 0.119999999999916 | -2.113 | -0.703 | -0.358 |
| 0.124999999999916 | -2.072 | -0.693 | -0.353 |
| 0.129999999999916 | -2.032 | -0.683 | -0.349 |
| 0.134999999999916 | -1.993 | -0.673 | -0.344 |
| 0.139999999999916 | -1.956 | -0.664 | -0.34 |
| 0.144999999999916 | -1.92 | -0.655 | -0.336 |
| 0.149999999999916 | -1.886 | -0.647 | -0.333 |
| 0.154999999999916 | -1.852 | -0.639 | -0.329 |
| 0.159999999999916 | -1.82 | -0.631 | -0.326 |
| 0.164999999999916 | -1.788 | -0.623 | -0.322 |
| 0.169999999999916 | -1.757 | -0.615 | -0.319 |
| 0.174999999999916 | -1.727 | -0.608 | -0.316 |
| 0.179999999999916 | -1.698 | -0.601 | -0.312 |
| 0.184999999999916 | -1.67 | -0.594 | -0.309 |
| 0.189999999999916 | -1.642 | -0.587 | -0.306 |
| 0.194999999999916 | -1.615 | -0.581 | -0.303 |
| 0.199999999999916 | -1.589 | -0.574 | -0.301 |
| 0.204999999999916 | -1.563 | -0.568 | -0.298 |
| 0.209999999999916 | -1.538 | -0.562 | -0.295 |
| 0.214999999999916 | -1.513 | -0.556 | -0.293 |
| 0.219999999999916 | -1.489 | -0.55 | -0.29 |
| 0.224999999999916 | -1.466 | -0.545 | -0.287 |
| 0.229999999999916 | -1.443 | -0.539 | -0.285 |
| 0.234999999999916 | -1.42 | -0.534 | -0.283 |
| 0.239999999999916 | -1.397 | -0.528 | -0.28 |
| 0.244999999999916 | -1.376 | -0.523 | -0.278 |
| 0.249999999999916 | -1.354 | -0.518 | -0.276 |
| 0.254999999999916 | -1.333 | -0.513 | -0.273 |
| 0.259999999999916 | -1.312 | -0.508 | -0.271 |
| 0.264999999999916 | -1.292 | -0.503 | -0.269 |
| 0.269999999999916 | -1.271 | -0.498 | -0.267 |
| 0.274999999999916 | -1.252 | -0.494 | -0.265 |
| 0.279999999999916 | -1.232 | -0.489 | -0.263 |
| 0.284999999999916 | -1.213 | -0.485 | -0.261 |
| 0.289999999999916 | -1.194 | -0.48 | -0.259 |
| 0.294999999999916 | -1.175 | -0.476 | -0.257 |
| 0.299999999999916 | -1.157 | -0.471 | -0.255 |
| 0.304999999999916 | -1.139 | -0.467 | -0.253 |
| 0.309999999999916 | -1.121 | -0.463 | -0.252 |
| 0.314999999999916 | -1.103 | -0.459 | -0.25 |
| 0.319999999999916 | -1.085 | -0.455 | -0.248 |
| 0.324999999999916 | -1.068 | -0.451 | -0.246 |
| 0.329999999999916 | -1.051 | -0.447 | -0.245 |
| 0.334999999999916 | -1.034 | -0.443 | -0.243 |
| 0.339999999999916 | -1.017 | -0.439 | -0.241 |
| 0.344999999999916 | -1.001 | -0.436 | -0.24 |
| 0.349999999999916 | -0.984 | -0.432 | -0.238 |
| 0.354999999999916 | -0.968 | -0.428 | -0.236 |
| 0.359999999999916 | -0.952 | -0.425 | -0.235 |
| 0.364999999999916 | -0.936 | -0.421 | -0.233 |
| 0.369999999999916 | -0.921 | -0.417 | -0.232 |
| 0.374999999999916 | -0.905 | -0.414 | -0.23 |
| 0.379999999999916 | -0.89 | -0.411 | -0.229 |
| 0.384999999999916 | -0.874 | -0.407 | -0.227 |
| 0.389999999999916 | -0.859 | -0.404 | -0.226 |
| 0.394999999999916 | -0.844 | -0.401 | -0.224 |
| 0.399999999999916 | -0.829 | -0.397 | -0.223 |
| 0.404999999999916 | -0.814 | -0.394 | -0.221 |
| 0.409999999999916 | -0.8 | -0.391 | -0.22 |
| 0.414999999999916 | -0.785 | -0.388 | -0.219 |
| 0.419999999999916 | -0.77 | -0.385 | -0.217 |
| 0.424999999999916 | -0.756 | -0.381 | -0.216 |
| 0.429999999999916 | -0.742 | -0.378 | -0.215 |
| 0.434999999999916 | -0.728 | -0.375 | -0.213 |
| 0.439999999999916 | -0.713 | -0.372 | -0.212 |
| 0.444999999999916 | -0.699 | -0.369 | -0.211 |
| 0.449999999999916 | -0.685 | -0.366 | -0.21 |
| 0.454999999999916 | -0.671 | -0.364 | -0.208 |
| 0.459999999999916 | -0.658 | -0.361 | -0.207 |
| 0.464999999999916 | -0.644 | -0.358 | -0.206 |
| 0.469999999999916 | -0.63 | -0.355 | -0.205 |
| 0.474999999999916 | -0.617 | -0.352 | -0.203 |
| 0.479999999999916 | -0.603 | -0.349 | -0.202 |
| 0.484999999999916 | -0.59 | -0.347 | -0.201 |
| 0.489999999999916 | -0.576 | -0.344 | -0.2 |
| 0.494999999999916 | -0.563 | -0.341 | -0.199 |
| 0.499999999999916 | -0.549 | -0.339 | -0.198 |
| 0.504999999999916 | -0.536 | -0.336 | -0.196 |
| 0.509999999999916 | -0.523 | -0.333 | -0.195 |
| 0.514999999999916 | -0.509 | -0.331 | -0.194 |
| 0.519999999999916 | -0.496 | -0.328 | -0.193 |
| 0.524999999999916 | -0.483 | -0.325 | -0.192 |
| 0.529999999999916 | -0.47 | -0.323 | -0.191 |
| 0.534999999999916 | -0.457 | -0.32 | -0.19 |
| 0.539999999999916 | -0.444 | -0.318 | -0.189 |
| 0.544999999999916 | -0.431 | -0.315 | -0.188 |
| 0.549999999999916 | -0.418 | -0.313 | -0.187 |
| 0.554999999999916 | -0.405 | -0.31 | -0.186 |
| 0.559999999999916 | -0.392 | -0.308 | -0.185 |
| 0.564999999999916 | -0.379 | -0.306 | -0.183 |
| 0.569999999999916 | -0.366 | -0.303 | -0.182 |
| 0.574999999999916 | -0.353 | -0.301 | -0.181 |
| 0.579999999999916 | -0.34 | -0.298 | -0.18 |
| 0.584999999999916 | -0.327 | -0.296 | -0.179 |
| 0.589999999999916 | -0.314 | -0.294 | -0.179 |
| 0.594999999999916 | -0.301 | -0.292 | -0.178 |
| 0.599999999999916 | -0.288 | -0.289 | -0.177 |
| 0.604999999999916 | -0.275 | -0.287 | -0.176 |
| 0.609999999999916 | -0.262 | -0.285 | -0.175 |
| 0.614999999999916 | -0.249 | -0.282 | -0.174 |
| 0.619999999999916 | -0.235 | -0.28 | -0.173 |
| 0.624999999999916 | -0.222 | -0.278 | -0.172 |
| 0.629999999999916 | -0.209 | -0.276 | -0.171 |
| 0.634999999999916 | -0.196 | -0.274 | -0.17 |
| 0.639999999999916 | -0.183 | -0.271 | -0.169 |
| 0.644999999999916 | -0.17 | -0.269 | -0.168 |
| 0.649999999999916 | -0.156 | -0.267 | -0.167 |
| 0.654999999999916 | -0.143 | -0.265 | -0.166 |
| 0.659999999999916 | -0.13 | -0.263 | -0.165 |
| 0.664999999999916 | -0.116 | -0.261 | -0.165 |
| 0.669999999999916 | -0.103 | -0.259 | -0.164 |
| 0.674999999999916 | -0.089 | -0.256 | -0.163 |
| 0.679999999999916 | -0.075 | -0.254 | -0.162 |
| 0.684999999999916 | -0.062 | -0.252 | -0.161 |
| 0.689999999999916 | -0.048 | -0.25 | -0.16 |
| 0.694999999999916 | -0.034 | -0.248 | -0.159 |
| 0.699999999999916 | -0.02 | -0.246 | -0.159 |
| 0.704999999999916 | -0.006 | -0.244 | -0.158 |
| 0.709999999999916 | 0.008 | -0.242 | -0.157 |
| 0.714999999999916 | 0.022 | -0.24 | -0.156 |
| 0.719999999999916 | 0.037 | -0.238 | -0.155 |
| 0.724999999999916 | 0.051 | -0.236 | -0.154 |
| 0.729999999999916 | 0.066 | -0.234 | -0.154 |
| 0.734999999999916 | 0.081 | -0.232 | -0.153 |
| 0.739999999999916 | 0.095 | -0.23 | -0.152 |
| 0.744999999999916 | 0.11 | -0.228 | -0.151 |
| 0.749999999999916 | 0.126 | -0.226 | -0.15 |
| 0.754999999999916 | 0.141 | -0.224 | -0.15 |
| 0.759999999999916 | 0.156 | -0.222 | -0.149 |
| 0.764999999999916 | 0.172 | -0.22 | -0.148 |
| 0.769999999999916 | 0.188 | -0.219 | -0.147 |
| 0.774999999999916 | 0.204 | -0.217 | -0.147 |
| 0.779999999999916 | 0.22 | -0.215 | -0.146 |
| 0.784999999999916 | 0.237 | -0.213 | -0.145 |
| 0.789999999999916 | 0.253 | -0.211 | -0.144 |
| 0.794999999999916 | 0.27 | -0.209 | -0.144 |
| 0.799999999999916 | 0.288 | -0.207 | -0.143 |
| 0.804999999999916 | 0.305 | -0.205 | -0.142 |
| 0.809999999999916 | 0.323 | -0.204 | -0.141 |
| 0.814999999999916 | 0.341 | -0.202 | -0.141 |
| 0.819999999999916 | 0.36 | -0.2 | -0.14 |
| 0.824999999999916 | 0.378 | -0.198 | -0.139 |
| 0.829999999999916 | 0.397 | -0.196 | -0.138 |
| 0.834999999999916 | 0.417 | -0.194 | -0.138 |
| 0.839999999999916 | 0.437 | -0.193 | -0.137 |
| 0.844999999999916 | 0.458 | -0.191 | -0.136 |
| 0.849999999999916 | 0.478 | -0.189 | -0.135 |
| 0.854999999999916 | 0.5 | -0.187 | -0.135 |
| 0.859999999999916 | 0.522 | -0.185 | -0.134 |
| 0.864999999999916 | 0.545 | -0.184 | -0.133 |
| 0.869999999999916 | 0.568 | -0.182 | -0.133 |
| 0.874999999999916 | 0.592 | -0.18 | -0.132 |
| 0.879999999999916 | 0.617 | -0.178 | -0.131 |
| 0.884999999999916 | 0.642 | -0.177 | -0.131 |
| 0.889999999999916 | 0.669 | -0.175 | -0.13 |
| 0.894999999999916 | 0.696 | -0.173 | -0.129 |
| 0.899999999999916 | 0.725 | -0.171 | -0.129 |
| 0.904999999999916 | 0.755 | -0.17 | -0.128 |
| 0.909999999999916 | 0.786 | -0.168 | -0.127 |
| 0.914999999999916 | 0.819 | -0.166 | -0.127 |
| 0.919999999999916 | 0.853 | -0.164 | -0.126 |
| 0.924999999999916 | 0.89 | -0.163 | -0.125 |
| 0.929999999999916 | 0.928 | -0.161 | -0.125 |
| 0.934999999999916 | 0.969 | -0.159 | -0.124 |
| 0.939999999999916 | 1.013 | -0.158 | -0.123 |
| 0.944999999999916 | 1.061 | -0.156 | -0.123 |
| 0.949999999999916 | 1.113 | -0.154 | -0.122 |
| 0.954999999999916 | 1.169 | -0.152 | -0.121 |
| 0.959999999999916 | 1.232 | -0.151 | -0.121 |
| 0.964999999999916 | 1.303 | -0.149 | -0.12 |
| 0.969999999999916 | 1.384 | -0.147 | -0.119 |
| 0.974999999999916 | 1.479 | -0.146 | -0.119 |
| 0.979999999999916 | 1.594 | -0.144 | -0.118 |
| 0.984999999999916 | 1.742 | -0.142 | -0.117 |
| 0.989999999999916 | 1.948 | -0.141 | -0.117 |
| 0.994999999999916 | 2.299 | -0.139 | -0.116 |
| 0.999999999999916 | 14.709 | -0.137 | -0.116 |
| 1.004999999999916 | 2.306 | -0.136 | -0.115 |
| 1.009999999999916 | 1.963 | -0.134 | -0.114 |
| 1.014999999999916 | 1.764 | -0.132 | -0.114 |
| 1.019999999999916 | 1.624 | -0.131 | -0.113 |
| 1.024999999999916 | 1.516 | -0.129 | -0.112 |
| 1.029999999999916 | 1.429 | -0.127 | -0.112 |
| 1.034999999999916 | 1.355 | -0.126 | -0.111 |
| 1.039999999999915 | 1.292 | -0.124 | -0.111 |
| 1.044999999999915 | 1.237 | -0.122 | -0.11 |
| 1.049999999999915 | 1.188 | -0.121 | -0.109 |
| 1.054999999999915 | 1.144 | -0.119 | -0.109 |
| 1.059999999999915 | 1.104 | -0.118 | -0.108 |
| 1.064999999999915 | 1.067 | -0.116 | -0.108 |
| 1.069999999999915 | 1.034 | -0.114 | -0.107 |
| 1.074999999999915 | 1.002 | -0.113 | -0.106 |
| 1.079999999999915 | 0.974 | -0.111 | -0.106 |
| 1.084999999999914 | 0.947 | -0.109 | -0.105 |
| 1.089999999999914 | 0.922 | -0.108 | -0.105 |
| 1.094999999999914 | 0.898 | -0.106 | -0.104 |
| 1.099999999999914 | 0.876 | -0.104 | -0.103 |
| 1.104999999999914 | 0.855 | -0.103 | -0.103 |
| 1.109999999999914 | 0.835 | -0.101 | -0.102 |
| 1.114999999999914 | 0.816 | -0.1 | -0.102 |
| 1.119999999999914 | 0.798 | -0.098 | -0.101 |
| 1.124999999999914 | 0.781 | -0.096 | -0.101 |
| 1.129999999999914 | 0.764 | -0.095 | -0.1 |
| 1.134999999999913 | 0.749 | -0.093 | -0.099 |
| 1.139999999999913 | 0.734 | -0.091 | -0.099 |
| 1.144999999999913 | 0.719 | -0.09 | -0.098 |
| 1.149999999999913 | 0.706 | -0.088 | -0.098 |
| 1.154999999999913 | 0.692 | -0.087 | -0.097 |
| 1.159999999999913 | 0.68 | -0.085 | -0.097 |
| 1.164999999999913 | 0.667 | -0.083 | -0.096 |
| 1.169999999999913 | 0.656 | -0.082 | -0.095 |
| 1.174999999999913 | 0.644 | -0.08 | -0.095 |
| 1.179999999999912 | 0.633 | -0.078 | -0.094 |
| 1.184999999999912 | 0.623 | -0.077 | -0.094 |
| 1.189999999999912 | 0.612 | -0.075 | -0.093 |
| 1.194999999999912 | 0.602 | -0.074 | -0.093 |
| 1.199999999999912 | 0.593 | -0.072 | -0.092 |
| 1.204999999999912 | 0.583 | -0.07 | -0.092 |
| 1.209999999999912 | 0.574 | -0.069 | -0.091 |
| 1.214999999999912 | 0.566 | -0.067 | -0.09 |
| 1.219999999999912 | 0.557 | -0.065 | -0.09 |
| 1.224999999999911 | 0.549 | -0.064 | -0.089 |
| 1.229999999999911 | 0.541 | -0.062 | -0.089 |
| 1.234999999999911 | 0.533 | -0.061 | -0.088 |
| 1.239999999999911 | 0.525 | -0.059 | -0.088 |
| 1.244999999999911 | 0.518 | -0.057 | -0.087 |
| 1.249999999999911 | 0.511 | -0.056 | -0.087 |
| 1.254999999999911 | 0.504 | -0.054 | -0.086 |
| 1.259999999999911 | 0.497 | -0.052 | -0.086 |
| 1.264999999999911 | 0.49 | -0.051 | -0.085 |
| 1.269999999999911 | 0.484 | -0.049 | -0.085 |
| 1.27499999999991 | 0.477 | -0.047 | -0.084 |
| 1.27999999999991 | 0.471 | -0.046 | -0.083 |
| 1.28499999999991 | 0.465 | -0.044 | -0.083 |
| 1.28999999999991 | 0.459 | -0.042 | -0.082 |
| 1.29499999999991 | 0.454 | -0.041 | -0.082 |
| 1.29999999999991 | 0.448 | -0.039 | -0.081 |
| 1.30499999999991 | 0.442 | -0.037 | -0.081 |
| 1.30999999999991 | 0.437 | -0.036 | -0.08 |
| 1.31499999999991 | 0.432 | -0.034 | -0.08 |
| 1.319999999999909 | 0.427 | -0.032 | -0.079 |
| 1.324999999999909 | 0.422 | -0.031 | -0.079 |
| 1.329999999999909 | 0.417 | -0.029 | -0.078 |
| 1.334999999999909 | 0.412 | -0.027 | -0.078 |
| 1.339999999999909 | 0.407 | -0.026 | -0.077 |
| 1.344999999999909 | 0.402 | -0.024 | -0.077 |
| 1.349999999999909 | 0.398 | -0.022 | -0.076 |
| 1.354999999999909 | 0.393 | -0.021 | -0.076 |
| 1.359999999999909 | 0.389 | -0.019 | -0.075 |
| 1.364999999999908 | 0.385 | -0.017 | -0.075 |
| 1.369999999999908 | 0.38 | -0.015 | -0.074 |
| 1.374999999999908 | 0.376 | -0.014 | -0.074 |
| 1.379999999999908 | 0.372 | -0.012 | -0.073 |
| 1.384999999999908 | 0.368 | -0.01 | -0.073 |
| 1.389999999999908 | 0.364 | -0.008 | -0.072 |
| 1.394999999999908 | 0.361 | -0.007 | -0.072 |
| 1.399999999999908 | 0.357 | -0.005 | -0.071 |
| 1.404999999999908 | 0.353 | -0.003 | -0.071 |
| 1.409999999999908 | 0.35 | -0.001 | -0.07 |
| 1.414999999999907 | 0.346 | 0 | -0.07 |
| 1.419999999999907 | 0.343 | 0.002 | -0.069 |
| 1.424999999999907 | 0.339 | 0.004 | -0.069 |
| 1.429999999999907 | 0.336 | 0.006 | -0.068 |
| 1.434999999999907 | 0.332 | 0.007 | -0.068 |
| 1.439999999999907 | 0.329 | 0.009 | -0.067 |
| 1.444999999999907 | 0.326 | 0.011 | -0.067 |
| 1.449999999999907 | 0.323 | 0.013 | -0.066 |
| 1.454999999999907 | 0.32 | 0.015 | -0.066 |
| 1.459999999999906 | 0.317 | 0.016 | -0.065 |
| 1.464999999999906 | 0.314 | 0.018 | -0.065 |
| 1.469999999999906 | 0.311 | 0.02 | -0.064 |
| 1.474999999999906 | 0.308 | 0.022 | -0.064 |
| 1.479999999999906 | 0.305 | 0.024 | -0.063 |
| 1.484999999999906 | 0.302 | 0.026 | -0.063 |
| 1.489999999999906 | 0.299 | 0.028 | -0.062 |
| 1.494999999999906 | 0.297 | 0.03 | -0.062 |
| 1.499999999999906 | 0.294 | 0.031 | -0.061 |
| 1.504999999999906 | 0.291 | 0.033 | -0.061 |
| 1.509999999999905 | 0.289 | 0.035 | -0.06 |
| 1.514999999999905 | 0.286 | 0.037 | -0.06 |
| 1.519999999999905 | 0.284 | 0.039 | -0.059 |
| 1.524999999999905 | 0.281 | 0.041 | -0.059 |
| 1.529999999999905 | 0.279 | 0.043 | -0.058 |
| 1.534999999999905 | 0.276 | 0.045 | -0.058 |
| 1.539999999999905 | 0.274 | 0.047 | -0.057 |
| 1.544999999999905 | 0.271 | 0.049 | -0.057 |
| 1.549999999999905 | 0.269 | 0.051 | -0.056 |
| 1.554999999999904 | 0.267 | 0.053 | -0.056 |
| 1.559999999999904 | 0.265 | 0.055 | -0.055 |
| 1.564999999999904 | 0.262 | 0.057 | -0.055 |
| 1.569999999999904 | 0.26 | 0.059 | -0.054 |
| 1.574999999999904 | 0.258 | 0.061 | -0.054 |
| 1.579999999999904 | 0.256 | 0.063 | -0.053 |
| 1.584999999999904 | 0.254 | 0.065 | -0.053 |
| 1.589999999999904 | 0.252 | 0.068 | -0.052 |
| 1.594999999999904 | 0.25 | 0.07 | -0.052 |
| 1.599999999999903 | 0.248 | 0.072 | -0.051 |
| 1.604999999999903 | 0.246 | 0.074 | -0.051 |
| 1.609999999999903 | 0.244 | 0.076 | -0.05 |
| 1.614999999999903 | 0.242 | 0.079 | -0.05 |
| 1.619999999999903 | 0.24 | 0.081 | -0.049 |
| 1.624999999999903 | 0.238 | 0.083 | -0.049 |
| 1.629999999999903 | 0.236 | 0.085 | -0.048 |
| 1.634999999999903 | 0.234 | 0.088 | -0.048 |
| 1.639999999999903 | 0.232 | 0.09 | -0.047 |
| 1.644999999999902 | 0.231 | 0.092 | -0.047 |
| 1.649999999999902 | 0.229 | 0.095 | -0.046 |
| 1.654999999999902 | 0.227 | 0.097 | -0.046 |
| 1.659999999999902 | 0.225 | 0.099 | -0.045 |
| 1.664999999999902 | 0.224 | 0.102 | -0.045 |
| 1.669999999999902 | 0.222 | 0.104 | -0.044 |
| 1.674999999999902 | 0.22 | 0.107 | -0.044 |
| 1.679999999999902 | 0.219 | 0.109 | -0.044 |
| 1.684999999999902 | 0.217 | 0.112 | -0.043 |
| 1.689999999999901 | 0.215 | 0.114 | -0.043 |
| 1.694999999999901 | 0.214 | 0.117 | -0.042 |
| 1.699999999999901 | 0.212 | 0.12 | -0.042 |
| 1.704999999999901 | 0.211 | 0.122 | -0.041 |
| 1.709999999999901 | 0.209 | 0.125 | -0.041 |
| 1.714999999999901 | 0.208 | 0.128 | -0.04 |
| 1.719999999999901 | 0.206 | 0.13 | -0.04 |
| 1.724999999999901 | 0.205 | 0.133 | -0.039 |
| 1.729999999999901 | 0.203 | 0.136 | -0.039 |
| 1.734999999999901 | 0.202 | 0.139 | -0.038 |
| 1.7399999999999 | 0.2 | 0.142 | -0.038 |
| 1.7449999999999 | 0.199 | 0.145 | -0.037 |
| 1.7499999999999 | 0.198 | 0.148 | -0.037 |
| 1.7549999999999 | 0.196 | 0.151 | -0.036 |
| 1.7599999999999 | 0.195 | 0.154 | -0.036 |
| 1.7649999999999 | 0.194 | 0.157 | -0.035 |
| 1.7699999999999 | 0.192 | 0.161 | -0.035 |
| 1.7749999999999 | 0.191 | 0.164 | -0.034 |
| 1.7799999999999 | 0.19 | 0.167 | -0.034 |
| 1.784999999999899 | 0.188 | 0.171 | -0.033 |
| 1.789999999999899 | 0.187 | 0.174 | -0.033 |
| 1.794999999999899 | 0.186 | 0.178 | -0.032 |
| 1.799999999999899 | 0.185 | 0.181 | -0.032 |
| 1.804999999999899 | 0.183 | 0.185 | -0.031 |
| 1.809999999999899 | 0.182 | 0.189 | -0.031 |
| 1.814999999999899 | 0.181 | 0.193 | -0.031 |
| 1.819999999999899 | 0.18 | 0.197 | -0.03 |
| 1.824999999999899 | 0.179 | 0.201 | -0.03 |
| 1.829999999999899 | 0.177 | 0.205 | -0.029 |
| 1.834999999999898 | 0.176 | 0.209 | -0.029 |
| 1.839999999999898 | 0.175 | 0.213 | -0.028 |
| 1.844999999999898 | 0.174 | 0.218 | -0.028 |
| 1.849999999999898 | 0.173 | 0.222 | -0.027 |
| 1.854999999999898 | 0.172 | 0.227 | -0.027 |
| 1.859999999999898 | 0.171 | 0.232 | -0.026 |
| 1.864999999999898 | 0.169 | 0.237 | -0.026 |
| 1.869999999999898 | 0.168 | 0.242 | -0.025 |
| 1.874999999999898 | 0.167 | 0.248 | -0.025 |
| 1.879999999999897 | 0.166 | 0.253 | -0.024 |
| 1.884999999999897 | 0.165 | 0.259 | -0.024 |
| 1.889999999999897 | 0.164 | 0.265 | -0.023 |
| 1.894999999999897 | 0.163 | 0.272 | -0.023 |
| 1.899999999999897 | 0.162 | 0.278 | -0.022 |
| 1.904999999999897 | 0.161 | 0.285 | -0.022 |
| 1.909999999999897 | 0.16 | 0.292 | -0.021 |
| 1.914999999999897 | 0.159 | 0.3 | -0.021 |
| 1.919999999999897 | 0.158 | 0.308 | -0.02 |
| 1.924999999999897 | 0.157 | 0.317 | -0.02 |
| 1.929999999999896 | 0.156 | 0.326 | -0.019 |
| 1.934999999999896 | 0.155 | 0.335 | -0.019 |
| 1.939999999999896 | 0.154 | 0.346 | -0.018 |
| 1.944999999999896 | 0.153 | 0.357 | -0.018 |
| 1.949999999999896 | 0.153 | 0.37 | -0.017 |
| 1.954999999999896 | 0.152 | 0.383 | -0.017 |
| 1.959999999999896 | 0.151 | 0.399 | -0.016 |
| 1.964999999999896 | 0.15 | 0.416 | -0.016 |
| 1.969999999999896 | 0.149 | 0.435 | -0.015 |
| 1.974999999999895 | 0.148 | 0.459 | -0.015 |
| 1.979999999999895 | 0.147 | 0.487 | -0.014 |
| 1.984999999999895 | 0.146 | 0.524 | -0.014 |
| 1.989999999999895 | 0.146 | 0.575 | -0.013 |
| 1.994999999999895 | 0.145 | 0.662 | -0.013 |
| 1.999999999999895 | 0.144 | 3.735 | -0.012 |
| 2.004999999999895 | 0.143 | 0.663 | -0.012 |
| 2.009999999999895 | 0.142 | 0.577 | -0.011 |
| 2.014999999999895 | 0.141 | 0.526 | -0.011 |
| 2.019999999999895 | 0.141 | 0.491 | -0.01 |
| 2.024999999999895 | 0.14 | 0.463 | -0.01 |
| 2.029999999999895 | 0.139 | 0.441 | -0.009 |
| 2.034999999999894 | 0.138 | 0.422 | -0.009 |
| 2.039999999999894 | 0.137 | 0.406 | -0.008 |
| 2.044999999999894 | 0.137 | 0.392 | -0.008 |
| 2.049999999999894 | 0.136 | 0.379 | -0.007 |
| 2.054999999999894 | 0.135 | 0.368 | -0.007 |
| 2.059999999999894 | 0.134 | 0.357 | -0.006 |
| 2.064999999999894 | 0.134 | 0.348 | -0.006 |
| 2.069999999999894 | 0.133 | 0.339 | -0.005 |
| 2.074999999999894 | 0.132 | 0.331 | -0.005 |
| 2.079999999999893 | 0.131 | 0.323 | -0.004 |
| 2.084999999999893 | 0.131 | 0.316 | -0.004 |
| 2.089999999999893 | 0.13 | 0.309 | -0.003 |
| 2.094999999999893 | 0.129 | 0.303 | -0.003 |
| 2.099999999999893 | 0.129 | 0.297 | -0.002 |
| 2.104999999999893 | 0.128 | 0.291 | -0.002 |
| 2.109999999999893 | 0.127 | 0.286 | -0.001 |
| 2.114999999999893 | 0.127 | 0.281 | -0.001 |
| 2.119999999999893 | 0.126 | 0.276 | 0 |
| 2.124999999999893 | 0.125 | 0.271 | 0 |
| 2.129999999999892 | 0.124 | 0.267 | 0.001 |
| 2.134999999999892 | 0.124 | 0.262 | 0.001 |
| 2.139999999999892 | 0.123 | 0.258 | 0.002 |
| 2.144999999999892 | 0.123 | 0.254 | 0.002 |
| 2.149999999999892 | 0.122 | 0.251 | 0.003 |
| 2.154999999999892 | 0.121 | 0.247 | 0.004 |
| 2.159999999999892 | 0.121 | 0.243 | 0.004 |
| 2.164999999999892 | 0.12 | 0.24 | 0.005 |
| 2.169999999999892 | 0.119 | 0.237 | 0.005 |
| 2.174999999999891 | 0.119 | 0.233 | 0.006 |
| 2.179999999999891 | 0.118 | 0.23 | 0.006 |
| 2.184999999999891 | 0.118 | 0.227 | 0.007 |
| 2.189999999999891 | 0.117 | 0.224 | 0.007 |
| 2.194999999999891 | 0.116 | 0.222 | 0.008 |
| 2.199999999999891 | 0.116 | 0.219 | 0.008 |
| 2.204999999999891 | 0.115 | 0.216 | 0.009 |
| 2.209999999999891 | 0.115 | 0.214 | 0.01 |
| 2.214999999999891 | 0.114 | 0.211 | 0.01 |
| 2.21999999999989 | 0.113 | 0.209 | 0.011 |
| 2.22499999999989 | 0.113 | 0.206 | 0.011 |
| 2.22999999999989 | 0.112 | 0.204 | 0.012 |
| 2.23499999999989 | 0.112 | 0.202 | 0.012 |
| 2.23999999999989 | 0.111 | 0.199 | 0.013 |
| 2.24499999999989 | 0.111 | 0.197 | 0.013 |
| 2.24999999999989 | 0.11 | 0.195 | 0.014 |
| 2.25499999999989 | 0.109 | 0.193 | 0.015 |
| 2.25999999999989 | 0.109 | 0.191 | 0.015 |
| 2.26499999999989 | 0.108 | 0.189 | 0.016 |
| 2.269999999999889 | 0.108 | 0.187 | 0.016 |
| 2.274999999999889 | 0.107 | 0.185 | 0.017 |
| 2.279999999999889 | 0.107 | 0.183 | 0.017 |
| 2.284999999999889 | 0.106 | 0.182 | 0.018 |
| 2.289999999999889 | 0.106 | 0.18 | 0.019 |
| 2.294999999999889 | 0.105 | 0.178 | 0.019 |
| 2.299999999999889 | 0.105 | 0.176 | 0.02 |
| 2.304999999999889 | 0.104 | 0.175 | 0.02 |
| 2.309999999999889 | 0.104 | 0.173 | 0.021 |
| 2.314999999999888 | 0.103 | 0.171 | 0.021 |
| 2.319999999999888 | 0.103 | 0.17 | 0.022 |
| 2.324999999999888 | 0.102 | 0.168 | 0.023 |
| 2.329999999999888 | 0.102 | 0.167 | 0.023 |
| 2.334999999999888 | 0.101 | 0.165 | 0.024 |
| 2.339999999999888 | 0.101 | 0.164 | 0.024 |
| 2.344999999999888 | 0.1 | 0.162 | 0.025 |
| 2.349999999999888 | 0.1 | 0.161 | 0.026 |
| 2.354999999999888 | 0.099 | 0.16 | 0.026 |
| 2.359999999999887 | 0.099 | 0.158 | 0.027 |
| 2.364999999999887 | 0.098 | 0.157 | 0.028 |
| 2.369999999999887 | 0.098 | 0.156 | 0.028 |
| 2.374999999999887 | 0.098 | 0.154 | 0.029 |
| 2.379999999999887 | 0.097 | 0.153 | 0.029 |
| 2.384999999999887 | 0.097 | 0.152 | 0.03 |
| 2.389999999999887 | 0.096 | 0.151 | 0.031 |
| 2.394999999999887 | 0.096 | 0.149 | 0.031 |
| 2.399999999999887 | 0.095 | 0.148 | 0.032 |
| 2.404999999999887 | 0.095 | 0.147 | 0.033 |
| 2.409999999999886 | 0.094 | 0.146 | 0.033 |
| 2.414999999999886 | 0.094 | 0.145 | 0.034 |
| 2.419999999999886 | 0.094 | 0.144 | 0.035 |
| 2.424999999999886 | 0.093 | 0.143 | 0.035 |
| 2.429999999999886 | 0.093 | 0.141 | 0.036 |
| 2.434999999999886 | 0.092 | 0.14 | 0.037 |
| 2.439999999999886 | 0.092 | 0.139 | 0.037 |
| 2.444999999999886 | 0.092 | 0.138 | 0.038 |
| 2.449999999999886 | 0.091 | 0.137 | 0.039 |
| 2.454999999999885 | 0.091 | 0.136 | 0.039 |
| 2.459999999999885 | 0.09 | 0.135 | 0.04 |
| 2.464999999999885 | 0.09 | 0.134 | 0.041 |
| 2.469999999999885 | 0.09 | 0.133 | 0.041 |
| 2.474999999999885 | 0.089 | 0.132 | 0.042 |
| 2.479999999999885 | 0.089 | 0.131 | 0.043 |
| 2.484999999999885 | 0.088 | 0.13 | 0.043 |
| 2.489999999999885 | 0.088 | 0.13 | 0.044 |
| 2.494999999999885 | 0.088 | 0.129 | 0.045 |
| 2.499999999999884 | 0.087 | 0.128 | 0.046 |
| 2.504999999999884 | 0.087 | 0.127 | 0.046 |
| 2.509999999999884 | 0.086 | 0.126 | 0.047 |
| 2.514999999999884 | 0.086 | 0.125 | 0.048 |
| 2.519999999999884 | 0.086 | 0.124 | 0.049 |
| 2.524999999999884 | 0.085 | 0.123 | 0.049 |
| 2.529999999999884 | 0.085 | 0.123 | 0.05 |
| 2.534999999999884 | 0.085 | 0.122 | 0.051 |
| 2.539999999999884 | 0.084 | 0.121 | 0.052 |
| 2.544999999999884 | 0.084 | 0.12 | 0.052 |
| 2.549999999999883 | 0.083 | 0.119 | 0.053 |
| 2.554999999999883 | 0.083 | 0.119 | 0.054 |
| 2.559999999999883 | 0.083 | 0.118 | 0.055 |
| 2.564999999999883 | 0.082 | 0.117 | 0.056 |
| 2.569999999999883 | 0.082 | 0.116 | 0.056 |
| 2.574999999999883 | 0.082 | 0.116 | 0.057 |
| 2.579999999999883 | 0.081 | 0.115 | 0.058 |
| 2.584999999999883 | 0.081 | 0.114 | 0.059 |
| 2.589999999999883 | 0.081 | 0.113 | 0.06 |
| 2.594999999999882 | 0.08 | 0.113 | 0.061 |
| 2.599999999999882 | 0.08 | 0.112 | 0.061 |
| 2.604999999999882 | 0.08 | 0.111 | 0.062 |
| 2.609999999999882 | 0.079 | 0.111 | 0.063 |
| 2.614999999999882 | 0.079 | 0.11 | 0.064 |
| 2.619999999999882 | 0.079 | 0.109 | 0.065 |
| 2.624999999999882 | 0.078 | 0.109 | 0.066 |
| 2.629999999999882 | 0.078 | 0.108 | 0.067 |
| 2.634999999999882 | 0.078 | 0.107 | 0.068 |
| 2.639999999999881 | 0.077 | 0.107 | 0.069 |
| 2.644999999999881 | 0.077 | 0.106 | 0.069 |
| 2.649999999999881 | 0.077 | 0.105 | 0.07 |
| 2.654999999999881 | 0.076 | 0.105 | 0.071 |
| 2.659999999999881 | 0.076 | 0.104 | 0.072 |
| 2.664999999999881 | 0.076 | 0.104 | 0.073 |
| 2.669999999999881 | 0.076 | 0.103 | 0.074 |
| 2.674999999999881 | 0.075 | 0.102 | 0.075 |
| 2.679999999999881 | 0.075 | 0.102 | 0.076 |
| 2.68499999999988 | 0.075 | 0.101 | 0.077 |
| 2.68999999999988 | 0.074 | 0.101 | 0.078 |
| 2.69499999999988 | 0.074 | 0.1 | 0.079 |
| 2.69999999999988 | 0.074 | 0.099 | 0.081 |
| 2.70499999999988 | 0.073 | 0.099 | 0.082 |
| 2.70999999999988 | 0.073 | 0.098 | 0.083 |
| 2.71499999999988 | 0.073 | 0.098 | 0.084 |
| 2.71999999999988 | 0.073 | 0.097 | 0.085 |
| 2.72499999999988 | 0.072 | 0.097 | 0.086 |
| 2.72999999999988 | 0.072 | 0.096 | 0.087 |
| 2.734999999999879 | 0.072 | 0.096 | 0.089 |
| 2.739999999999879 | 0.071 | 0.095 | 0.09 |
| 2.744999999999879 | 0.071 | 0.095 | 0.091 |
| 2.749999999999879 | 0.071 | 0.094 | 0.092 |
| 2.754999999999879 | 0.071 | 0.094 | 0.094 |
| 2.759999999999879 | 0.07 | 0.093 | 0.095 |
| 2.764999999999879 | 0.07 | 0.093 | 0.096 |
| 2.769999999999879 | 0.07 | 0.092 | 0.097 |
| 2.774999999999879 | 0.07 | 0.092 | 0.099 |
| 2.779999999999878 | 0.069 | 0.091 | 0.1 |
| 2.784999999999878 | 0.069 | 0.091 | 0.102 |
| 2.789999999999878 | 0.069 | 0.09 | 0.103 |
| 2.794999999999878 | 0.068 | 0.09 | 0.105 |
| 2.799999999999878 | 0.068 | 0.089 | 0.106 |
| 2.804999999999878 | 0.068 | 0.089 | 0.108 |
| 2.809999999999878 | 0.068 | 0.088 | 0.109 |
| 2.814999999999878 | 0.067 | 0.088 | 0.111 |
| 2.819999999999878 | 0.067 | 0.087 | 0.113 |
| 2.824999999999878 | 0.067 | 0.087 | 0.114 |
| 2.829999999999877 | 0.067 | 0.087 | 0.116 |
| 2.834999999999877 | 0.066 | 0.086 | 0.118 |
| 2.839999999999877 | 0.066 | 0.086 | 0.12 |
| 2.844999999999877 | 0.066 | 0.085 | 0.122 |
| 2.849999999999877 | 0.066 | 0.085 | 0.124 |
| 2.854999999999877 | 0.065 | 0.084 | 0.126 |
| 2.859999999999877 | 0.065 | 0.084 | 0.128 |
| 2.864999999999877 | 0.065 | 0.084 | 0.13 |
| 2.869999999999877 | 0.065 | 0.083 | 0.132 |
| 2.874999999999876 | 0.064 | 0.083 | 0.134 |
| 2.879999999999876 | 0.064 | 0.082 | 0.137 |
| 2.884999999999876 | 0.064 | 0.082 | 0.139 |
| 2.889999999999876 | 0.064 | 0.081 | 0.142 |
| 2.894999999999876 | 0.064 | 0.081 | 0.145 |
| 2.899999999999876 | 0.063 | 0.081 | 0.148 |
| 2.904999999999876 | 0.063 | 0.08 | 0.151 |
| 2.909999999999876 | 0.063 | 0.08 | 0.154 |
| 2.914999999999876 | 0.063 | 0.08 | 0.157 |
| 2.919999999999876 | 0.062 | 0.079 | 0.161 |
| 2.924999999999875 | 0.062 | 0.079 | 0.164 |
| 2.929999999999875 | 0.062 | 0.078 | 0.168 |
| 2.934999999999875 | 0.062 | 0.078 | 0.173 |
| 2.939999999999875 | 0.061 | 0.078 | 0.177 |
| 2.944999999999875 | 0.061 | 0.077 | 0.182 |
| 2.949999999999875 | 0.061 | 0.077 | 0.188 |
| 2.954999999999875 | 0.061 | 0.077 | 0.194 |
| 2.959999999999875 | 0.061 | 0.076 | 0.2 |
| 2.964999999999875 | 0.06 | 0.076 | 0.208 |
| 2.969999999999874 | 0.06 | 0.076 | 0.216 |
| 2.974999999999874 | 0.06 | 0.075 | 0.227 |
| 2.979999999999874 | 0.06 | 0.075 | 0.239 |
| 2.984999999999874 | 0.06 | 0.074 | 0.255 |
| 2.989999999999874 | 0.059 | 0.074 | 0.278 |
| 2.994999999999874 | 0.059 | 0.074 | 0.317 |
| 2.999999999999874 | 0.059 | 0.073 | 5 |
| 3.004999999999874 | 0.059 | 0.073 | 0.317 |
| 3.009999999999874 | 0.058 | 0.073 | 0.279 |
| 3.014999999999874 | 0.058 | 0.072 | 0.256 |
| 3.019999999999873 | 0.058 | 0.072 | 0.24 |
| 3.024999999999873 | 0.058 | 0.072 | 0.228 |
| 3.029999999999873 | 0.058 | 0.072 | 0.218 |
| 3.034999999999873 | 0.057 | 0.071 | 0.21 |
| 3.039999999999873 | 0.057 | 0.071 | 0.202 |
| 3.044999999999873 | 0.057 | 0.071 | 0.196 |
| 3.049999999999873 | 0.057 | 0.07 | 0.19 |
| 3.054999999999873 | 0.057 | 0.07 | 0.185 |
| 3.059999999999873 | 0.056 | 0.07 | 0.18 |
| 3.064999999999872 | 0.056 | 0.069 | 0.176 |
| 3.069999999999872 | 0.056 | 0.069 | 0.172 |
| 3.074999999999872 | 0.056 | 0.069 | 0.168 |
| 3.079999999999872 | 0.056 | 0.068 | 0.165 |
| 3.084999999999872 | 0.056 | 0.068 | 0.162 |
| 3.089999999999872 | 0.055 | 0.068 | 0.159 |
| 3.094999999999872 | 0.055 | 0.068 | 0.156 |
| 3.099999999999872 | 0.055 | 0.067 | 0.153 |
| 3.104999999999872 | 0.055 | 0.067 | 0.151 |
| 3.109999999999872 | 0.055 | 0.067 | 0.148 |
| 3.114999999999871 | 0.054 | 0.066 | 0.146 |
| 3.119999999999871 | 0.054 | 0.066 | 0.144 |
| 3.124999999999871 | 0.054 | 0.066 | 0.141 |
| 3.129999999999871 | 0.054 | 0.066 | 0.139 |
| 3.134999999999871 | 0.054 | 0.065 | 0.137 |
| 3.139999999999871 | 0.053 | 0.065 | 0.136 |
| 3.144999999999871 | 0.053 | 0.065 | 0.134 |
| 3.149999999999871 | 0.053 | 0.065 | 0.132 |
| 3.154999999999871 | 0.053 | 0.064 | 0.13 |
| 3.15999999999987 | 0.053 | 0.064 | 0.129 |
| 3.16499999999987 | 0.053 | 0.064 | 0.127 |
| 3.16999999999987 | 0.052 | 0.063 | 0.126 |
| 3.17499999999987 | 0.052 | 0.063 | 0.124 |
| 3.17999999999987 | 0.052 | 0.063 | 0.123 |
| 3.18499999999987 | 0.052 | 0.063 | 0.121 |
| 3.18999999999987 | 0.052 | 0.062 | 0.12 |
| 3.19499999999987 | 0.052 | 0.062 | 0.119 |
| 3.19999999999987 | 0.051 | 0.062 | 0.117 |
| 3.204999999999869 | 0.051 | 0.062 | 0.116 |
| 3.209999999999869 | 0.051 | 0.061 | 0.115 |
| 3.214999999999869 | 0.051 | 0.061 | 0.114 |
| 3.219999999999869 | 0.051 | 0.061 | 0.113 |
| 3.224999999999869 | 0.051 | 0.061 | 0.111 |
| 3.229999999999869 | 0.05 | 0.06 | 0.11 |
| 3.234999999999869 | 0.05 | 0.06 | 0.109 |
| 3.239999999999869 | 0.05 | 0.06 | 0.108 |
| 3.244999999999869 | 0.05 | 0.06 | 0.107 |
| 3.249999999999869 | 0.05 | 0.059 | 0.106 |
| 3.254999999999868 | 0.05 | 0.059 | 0.105 |
| 3.259999999999868 | 0.049 | 0.059 | 0.104 |
| 3.264999999999868 | 0.049 | 0.059 | 0.103 |
| 3.269999999999868 | 0.049 | 0.059 | 0.102 |
| 3.274999999999868 | 0.049 | 0.058 | 0.102 |
| 3.279999999999868 | 0.049 | 0.058 | 0.101 |
| 3.284999999999868 | 0.049 | 0.058 | 0.1 |
| 3.289999999999868 | 0.048 | 0.058 | 0.099 |
| 3.294999999999868 | 0.048 | 0.057 | 0.098 |
| 3.299999999999867 | 0.048 | 0.057 | 0.097 |
| 3.304999999999867 | 0.048 | 0.057 | 0.096 |
| 3.309999999999867 | 0.048 | 0.057 | 0.096 |
| 3.314999999999867 | 0.048 | 0.057 | 0.095 |
| 3.319999999999867 | 0.048 | 0.056 | 0.094 |
| 3.324999999999867 | 0.047 | 0.056 | 0.093 |
| 3.329999999999867 | 0.047 | 0.056 | 0.093 |
| 3.334999999999867 | 0.047 | 0.056 | 0.092 |
| 3.339999999999867 | 0.047 | 0.056 | 0.091 |
| 3.344999999999866 | 0.047 | 0.055 | 0.091 |
| 3.349999999999866 | 0.047 | 0.055 | 0.09 |
| 3.354999999999866 | 0.047 | 0.055 | 0.089 |
| 3.359999999999866 | 0.046 | 0.055 | 0.089 |
| 3.364999999999866 | 0.046 | 0.054 | 0.088 |
| 3.369999999999866 | 0.046 | 0.054 | 0.087 |
| 3.374999999999866 | 0.046 | 0.054 | 0.087 |
| 3.379999999999866 | 0.046 | 0.054 | 0.086 |
| 3.384999999999866 | 0.046 | 0.054 | 0.086 |
| 3.389999999999866 | 0.046 | 0.053 | 0.085 |
| 3.394999999999865 | 0.045 | 0.053 | 0.084 |
| 3.399999999999865 | 0.045 | 0.053 | 0.084 |
| 3.404999999999865 | 0.045 | 0.053 | 0.083 |
| 3.409999999999865 | 0.045 | 0.053 | 0.083 |
| 3.414999999999865 | 0.045 | 0.053 | 0.082 |
| 3.419999999999865 | 0.045 | 0.052 | 0.082 |
| 3.424999999999865 | 0.045 | 0.052 | 0.081 |
| 3.429999999999865 | 0.044 | 0.052 | 0.08 |
| 3.434999999999865 | 0.044 | 0.052 | 0.08 |
| 3.439999999999864 | 0.044 | 0.052 | 0.079 |
| 3.444999999999864 | 0.044 | 0.051 | 0.079 |
| 3.449999999999864 | 0.044 | 0.051 | 0.078 |
| 3.454999999999864 | 0.044 | 0.051 | 0.078 |
| 3.459999999999864 | 0.044 | 0.051 | 0.077 |
| 3.464999999999864 | 0.043 | 0.051 | 0.077 |
| 3.469999999999864 | 0.043 | 0.05 | 0.076 |
| 3.474999999999864 | 0.043 | 0.05 | 0.076 |
| 3.479999999999864 | 0.043 | 0.05 | 0.076 |
| 3.484999999999864 | 0.043 | 0.05 | 0.075 |
| 3.489999999999863 | 0.043 | 0.05 | 0.075 |
| 3.494999999999863 | 0.043 | 0.05 | 0.074 |
| 3.499999999999863 | 0.043 | 0.049 | 0.074 |
| 3.504999999999863 | 0.042 | 0.049 | 0.073 |
| 3.509999999999863 | 0.042 | 0.049 | 0.073 |
| 3.514999999999863 | 0.042 | 0.049 | 0.072 |
| 3.519999999999863 | 0.042 | 0.049 | 0.072 |
| 3.524999999999863 | 0.042 | 0.049 | 0.072 |
| 3.529999999999863 | 0.042 | 0.048 | 0.071 |
| 3.534999999999862 | 0.042 | 0.048 | 0.071 |
| 3.539999999999862 | 0.042 | 0.048 | 0.07 |
| 3.544999999999862 | 0.041 | 0.048 | 0.07 |
| 3.549999999999862 | 0.041 | 0.048 | 0.07 |
| 3.554999999999862 | 0.041 | 0.048 | 0.069 |
| 3.559999999999862 | 0.041 | 0.047 | 0.069 |
| 3.564999999999862 | 0.041 | 0.047 | 0.068 |
| 3.569999999999862 | 0.041 | 0.047 | 0.068 |
| 3.574999999999862 | 0.041 | 0.047 | 0.068 |
| 3.579999999999862 | 0.041 | 0.047 | 0.067 |
| 3.584999999999861 | 0.041 | 0.047 | 0.067 |
| 3.589999999999861 | 0.04 | 0.046 | 0.067 |
| 3.594999999999861 | 0.04 | 0.046 | 0.066 |
| 3.599999999999861 | 0.04 | 0.046 | 0.066 |
| 3.604999999999861 | 0.04 | 0.046 | 0.066 |
| 3.609999999999861 | 0.04 | 0.046 | 0.065 |
| 3.614999999999861 | 0.04 | 0.046 | 0.065 |
| 3.619999999999861 | 0.04 | 0.046 | 0.064 |
| 3.62499999999986 | 0.04 | 0.045 | 0.064 |
| 3.62999999999986 | 0.039 | 0.045 | 0.064 |
| 3.63499999999986 | 0.039 | 0.045 | 0.063 |
| 3.63999999999986 | 0.039 | 0.045 | 0.063 |
| 3.64499999999986 | 0.039 | 0.045 | 0.063 |
| 3.64999999999986 | 0.039 | 0.045 | 0.063 |
| 3.65499999999986 | 0.039 | 0.044 | 0.062 |
| 3.65999999999986 | 0.039 | 0.044 | 0.062 |
| 3.66499999999986 | 0.039 | 0.044 | 0.062 |
| 3.669999999999859 | 0.039 | 0.044 | 0.061 |
| 3.674999999999859 | 0.038 | 0.044 | 0.061 |
| 3.679999999999859 | 0.038 | 0.044 | 0.061 |
| 3.684999999999859 | 0.038 | 0.044 | 0.06 |
| 3.689999999999859 | 0.038 | 0.043 | 0.06 |
| 3.694999999999859 | 0.038 | 0.043 | 0.06 |
| 3.699999999999859 | 0.038 | 0.043 | 0.06 |
| 3.704999999999859 | 0.038 | 0.043 | 0.059 |
| 3.709999999999859 | 0.038 | 0.043 | 0.059 |
| 3.714999999999859 | 0.038 | 0.043 | 0.059 |
| 3.719999999999858 | 0.038 | 0.043 | 0.058 |
| 3.724999999999858 | 0.037 | 0.043 | 0.058 |
| 3.729999999999858 | 0.037 | 0.042 | 0.058 |
| 3.734999999999858 | 0.037 | 0.042 | 0.058 |
| 3.739999999999858 | 0.037 | 0.042 | 0.057 |
| 3.744999999999858 | 0.037 | 0.042 | 0.057 |
| 3.749999999999858 | 0.037 | 0.042 | 0.057 |
| 3.754999999999858 | 0.037 | 0.042 | 0.056 |
| 3.759999999999858 | 0.037 | 0.042 | 0.056 |
| 3.764999999999857 | 0.037 | 0.041 | 0.056 |
| 3.769999999999857 | 0.036 | 0.041 | 0.056 |
| 3.774999999999857 | 0.036 | 0.041 | 0.055 |
| 3.779999999999857 | 0.036 | 0.041 | 0.055 |
| 3.784999999999857 | 0.036 | 0.041 | 0.055 |
| 3.789999999999857 | 0.036 | 0.041 | 0.055 |
| 3.794999999999857 | 0.036 | 0.041 | 0.054 |
| 3.799999999999857 | 0.036 | 0.041 | 0.054 |
| 3.804999999999857 | 0.036 | 0.04 | 0.054 |
| 3.809999999999857 | 0.036 | 0.04 | 0.054 |
| 3.814999999999856 | 0.036 | 0.04 | 0.054 |
| 3.819999999999856 | 0.035 | 0.04 | 0.053 |
| 3.824999999999856 | 0.035 | 0.04 | 0.053 |
| 3.829999999999856 | 0.035 | 0.04 | 0.053 |
| 3.834999999999856 | 0.035 | 0.04 | 0.053 |
| 3.839999999999856 | 0.035 | 0.04 | 0.052 |
| 3.844999999999856 | 0.035 | 0.039 | 0.052 |
| 3.849999999999856 | 0.035 | 0.039 | 0.052 |
| 3.854999999999856 | 0.035 | 0.039 | 0.052 |
| 3.859999999999855 | 0.035 | 0.039 | 0.051 |
| 3.864999999999855 | 0.035 | 0.039 | 0.051 |
| 3.869999999999855 | 0.035 | 0.039 | 0.051 |
| 3.874999999999855 | 0.034 | 0.039 | 0.051 |
| 3.879999999999855 | 0.034 | 0.039 | 0.051 |
| 3.884999999999855 | 0.034 | 0.038 | 0.05 |
| 3.889999999999855 | 0.034 | 0.038 | 0.05 |
| 3.894999999999855 | 0.034 | 0.038 | 0.05 |
| 3.899999999999855 | 0.034 | 0.038 | 0.05 |
| 3.904999999999855 | 0.034 | 0.038 | 0.05 |
| 3.909999999999854 | 0.034 | 0.038 | 0.049 |
| 3.914999999999854 | 0.034 | 0.038 | 0.049 |
| 3.919999999999854 | 0.034 | 0.038 | 0.049 |
| 3.924999999999854 | 0.034 | 0.038 | 0.049 |
| 3.929999999999854 | 0.033 | 0.037 | 0.049 |
| 3.934999999999854 | 0.033 | 0.037 | 0.048 |
| 3.939999999999854 | 0.033 | 0.037 | 0.048 |
| 3.944999999999854 | 0.033 | 0.037 | 0.048 |
| 3.949999999999854 | 0.033 | 0.037 | 0.048 |
| 3.954999999999853 | 0.033 | 0.037 | 0.048 |
| 3.959999999999853 | 0.033 | 0.037 | 0.047 |
| 3.964999999999853 | 0.033 | 0.037 | 0.047 |
| 3.969999999999853 | 0.033 | 0.037 | 0.047 |
| 3.974999999999853 | 0.033 | 0.036 | 0.047 |
| 3.979999999999853 | 0.033 | 0.036 | 0.047 |
| 3.984999999999853 | 0.033 | 0.036 | 0.046 |
| 3.989999999999853 | 0.032 | 0.036 | 0.046 |
| 3.994999999999853 | 0.032 | 0.036 | 0.046 |
| 3.999999999999853 | 0.032 | 0.036 | 0.046 |
| 4.004999999999852 | 0.032 | 0.036 | 0.046 |
| 4.009999999999852 | 0.032 | 0.036 | 0.046 |
| 4.014999999999852 | 0.032 | 0.036 | 0.045 |
| 4.019999999999852 | 0.032 | 0.036 | 0.045 |
| 4.024999999999852 | 0.032 | 0.035 | 0.045 |
| 4.029999999999852 | 0.032 | 0.035 | 0.045 |
| 4.034999999999852 | 0.032 | 0.035 | 0.045 |
| 4.039999999999851 | 0.032 | 0.035 | 0.045 |
| 4.044999999999852 | 0.032 | 0.035 | 0.044 |
| 4.049999999999851 | 0.031 | 0.035 | 0.044 |
| 4.054999999999851 | 0.031 | 0.035 | 0.044 |
| 4.059999999999851 | 0.031 | 0.035 | 0.044 |
| 4.064999999999851 | 0.031 | 0.035 | 0.044 |
| 4.069999999999851 | 0.031 | 0.035 | 0.044 |
| 4.074999999999851 | 0.031 | 0.034 | 0.043 |
| 4.07999999999985 | 0.031 | 0.034 | 0.043 |
| 4.084999999999851 | 0.031 | 0.034 | 0.043 |
| 4.08999999999985 | 0.031 | 0.034 | 0.043 |
| 4.094999999999851 | 0.031 | 0.034 | 0.043 |
| 4.09999999999985 | 0.031 | 0.034 | 0.043 |
| 4.10499999999985 | 0.031 | 0.034 | 0.042 |
| 4.10999999999985 | 0.031 | 0.034 | 0.042 |
| 4.11499999999985 | 0.03 | 0.034 | 0.042 |
| 4.11999999999985 | 0.03 | 0.034 | 0.042 |
| 4.12499999999985 | 0.03 | 0.033 | 0.042 |
| 4.12999999999985 | 0.03 | 0.033 | 0.042 |
| 4.13499999999985 | 0.03 | 0.033 | 0.042 |
| 4.13999999999985 | 0.03 | 0.033 | 0.041 |
| 4.144999999999849 | 0.03 | 0.033 | 0.041 |
| 4.14999999999985 | 0.03 | 0.033 | 0.041 |
| 4.154999999999849 | 0.03 | 0.033 | 0.041 |
| 4.15999999999985 | 0.03 | 0.033 | 0.041 |
| 4.164999999999849 | 0.03 | 0.033 | 0.041 |
| 4.169999999999849 | 0.03 | 0.033 | 0.04 |
| 4.174999999999849 | 0.03 | 0.033 | 0.04 |
| 4.179999999999848 | 0.029 | 0.032 | 0.04 |
| 4.184999999999849 | 0.029 | 0.032 | 0.04 |
| 4.189999999999848 | 0.029 | 0.032 | 0.04 |
| 4.194999999999848 | 0.029 | 0.032 | 0.04 |
| 4.199999999999848 | 0.029 | 0.032 | 0.04 |
| 4.204999999999848 | 0.029 | 0.032 | 0.04 |
| 4.209999999999848 | 0.029 | 0.032 | 0.039 |
| 4.214999999999848 | 0.029 | 0.032 | 0.039 |
| 4.219999999999847 | 0.029 | 0.032 | 0.039 |
| 4.224999999999848 | 0.029 | 0.032 | 0.039 |
| 4.229999999999847 | 0.029 | 0.032 | 0.039 |
| 4.234999999999847 | 0.029 | 0.032 | 0.039 |
| 4.239999999999847 | 0.029 | 0.031 | 0.039 |
| 4.244999999999847 | 0.029 | 0.031 | 0.038 |
| 4.249999999999847 | 0.028 | 0.031 | 0.038 |
| 4.254999999999847 | 0.028 | 0.031 | 0.038 |
| 4.259999999999846 | 0.028 | 0.031 | 0.038 |
| 4.264999999999847 | 0.028 | 0.031 | 0.038 |
| 4.269999999999846 | 0.028 | 0.031 | 0.038 |
| 4.274999999999846 | 0.028 | 0.031 | 0.038 |
| 4.279999999999846 | 0.028 | 0.031 | 0.038 |
| 4.284999999999846 | 0.028 | 0.031 | 0.037 |
| 4.289999999999846 | 0.028 | 0.031 | 0.037 |
| 4.294999999999846 | 0.028 | 0.031 | 0.037 |
| 4.299999999999846 | 0.028 | 0.03 | 0.037 |
| 4.304999999999846 | 0.028 | 0.03 | 0.037 |
| 4.309999999999845 | 0.028 | 0.03 | 0.037 |
| 4.314999999999846 | 0.028 | 0.03 | 0.037 |
| 4.319999999999845 | 0.028 | 0.03 | 0.037 |
| 4.324999999999846 | 0.027 | 0.03 | 0.036 |
| 4.329999999999845 | 0.027 | 0.03 | 0.036 |
| 4.334999999999845 | 0.027 | 0.03 | 0.036 |
| 4.339999999999845 | 0.027 | 0.03 | 0.036 |
| 4.344999999999845 | 0.027 | 0.03 | 0.036 |
| 4.349999999999845 | 0.027 | 0.03 | 0.036 |
| 4.354999999999845 | 0.027 | 0.03 | 0.036 |
| 4.359999999999844 | 0.027 | 0.03 | 0.036 |
| 4.364999999999845 | 0.027 | 0.029 | 0.036 |
| 4.369999999999844 | 0.027 | 0.029 | 0.035 |
| 4.374999999999844 | 0.027 | 0.029 | 0.035 |
| 4.379999999999844 | 0.027 | 0.029 | 0.035 |
| 4.384999999999844 | 0.027 | 0.029 | 0.035 |
| 4.389999999999844 | 0.027 | 0.029 | 0.035 |
| 4.394999999999844 | 0.027 | 0.029 | 0.035 |
| 4.399999999999844 | 0.027 | 0.029 | 0.035 |
| 4.404999999999844 | 0.026 | 0.029 | 0.035 |
| 4.409999999999843 | 0.026 | 0.029 | 0.035 |
| 4.414999999999844 | 0.026 | 0.029 | 0.034 |
| 4.419999999999843 | 0.026 | 0.029 | 0.034 |
| 4.424999999999843 | 0.026 | 0.029 | 0.034 |
| 4.429999999999843 | 0.026 | 0.028 | 0.034 |
| 4.434999999999843 | 0.026 | 0.028 | 0.034 |
| 4.439999999999843 | 0.026 | 0.028 | 0.034 |
| 4.444999999999843 | 0.026 | 0.028 | 0.034 |
| 4.449999999999842 | 0.026 | 0.028 | 0.034 |
| 4.454999999999843 | 0.026 | 0.028 | 0.034 |
| 4.459999999999842 | 0.026 | 0.028 | 0.033 |
| 4.464999999999843 | 0.026 | 0.028 | 0.033 |
| 4.469999999999842 | 0.026 | 0.028 | 0.033 |
| 4.474999999999842 | 0.026 | 0.028 | 0.033 |
| 4.479999999999842 | 0.026 | 0.028 | 0.033 |
| 4.484999999999842 | 0.025 | 0.028 | 0.033 |
| 4.489999999999842 | 0.025 | 0.028 | 0.033 |
| 4.494999999999842 | 0.025 | 0.028 | 0.033 |
| 4.499999999999841 | 0.025 | 0.028 | 0.033 |
| 4.504999999999842 | 0.025 | 0.027 | 0.033 |
| 4.509999999999841 | 0.025 | 0.027 | 0.032 |
| 4.514999999999842 | 0.025 | 0.027 | 0.032 |
| 4.519999999999841 | 0.025 | 0.027 | 0.032 |
| 4.524999999999841 | 0.025 | 0.027 | 0.032 |
| 4.529999999999841 | 0.025 | 0.027 | 0.032 |
| 4.534999999999841 | 0.025 | 0.027 | 0.032 |
| 4.53999999999984 | 0.025 | 0.027 | 0.032 |
| 4.544999999999841 | 0.025 | 0.027 | 0.032 |
| 4.54999999999984 | 0.025 | 0.027 | 0.032 |
| 4.554999999999841 | 0.025 | 0.027 | 0.032 |
| 4.55999999999984 | 0.025 | 0.027 | 0.032 |
| 4.564999999999841 | 0.025 | 0.027 | 0.031 |
| 4.56999999999984 | 0.025 | 0.027 | 0.031 |
| 4.57499999999984 | 0.024 | 0.027 | 0.031 |
| 4.57999999999984 | 0.024 | 0.026 | 0.031 |
| 4.58499999999984 | 0.024 | 0.026 | 0.031 |
| 4.58999999999984 | 0.024 | 0.026 | 0.031 |
| 4.59499999999984 | 0.024 | 0.026 | 0.031 |
| 4.59999999999984 | 0.024 | 0.026 | 0.031 |
| 4.60499999999984 | 0.024 | 0.026 | 0.031 |
| 4.60999999999984 | 0.024 | 0.026 | 0.031 |
| 4.614999999999839 | 0.024 | 0.026 | 0.031 |
| 4.61999999999984 | 0.024 | 0.026 | 0.03 |
| 4.624999999999839 | 0.024 | 0.026 | 0.03 |
| 4.62999999999984 | 0.024 | 0.026 | 0.03 |
| 4.634999999999839 | 0.024 | 0.026 | 0.03 |
| 4.639999999999838 | 0.024 | 0.026 | 0.03 |
| 4.644999999999839 | 0.024 | 0.026 | 0.03 |
| 4.649999999999838 | 0.024 | 0.026 | 0.03 |
| 4.654999999999839 | 0.024 | 0.026 | 0.03 |
| 4.659999999999838 | 0.024 | 0.025 | 0.03 |
| 4.664999999999838 | 0.024 | 0.025 | 0.03 |
| 4.669999999999838 | 0.023 | 0.025 | 0.03 |
| 4.674999999999838 | 0.023 | 0.025 | 0.029 |
| 4.679999999999837 | 0.023 | 0.025 | 0.029 |
| 4.684999999999838 | 0.023 | 0.025 | 0.029 |
| 4.689999999999837 | 0.023 | 0.025 | 0.029 |
| 4.694999999999838 | 0.023 | 0.025 | 0.029 |
| 4.699999999999837 | 0.023 | 0.025 | 0.029 |
| 4.704999999999837 | 0.023 | 0.025 | 0.029 |
| 4.709999999999837 | 0.023 | 0.025 | 0.029 |
| 4.714999999999837 | 0.023 | 0.025 | 0.029 |
| 4.719999999999837 | 0.023 | 0.025 | 0.029 |
| 4.724999999999837 | 0.023 | 0.025 | 0.029 |
| 4.729999999999836 | 0.023 | 0.025 | 0.029 |
| 4.734999999999836 | 0.023 | 0.025 | 0.029 |
| 4.739999999999836 | 0.023 | 0.025 | 0.028 |
| 4.744999999999836 | 0.023 | 0.024 | 0.028 |
| 4.749999999999836 | 0.023 | 0.024 | 0.028 |
| 4.754999999999836 | 0.023 | 0.024 | 0.028 |
| 4.759999999999836 | 0.023 | 0.024 | 0.028 |
| 4.764999999999836 | 0.023 | 0.024 | 0.028 |
| 4.769999999999836 | 0.022 | 0.024 | 0.028 |
| 4.774999999999835 | 0.022 | 0.024 | 0.028 |
| 4.779999999999835 | 0.022 | 0.024 | 0.028 |
| 4.784999999999835 | 0.022 | 0.024 | 0.028 |
| 4.789999999999835 | 0.022 | 0.024 | 0.028 |
| 4.794999999999835 | 0.022 | 0.024 | 0.028 |
| 4.799999999999835 | 0.022 | 0.024 | 0.028 |
| 4.804999999999835 | 0.022 | 0.024 | 0.027 |
| 4.809999999999835 | 0.022 | 0.024 | 0.027 |
| 4.814999999999835 | 0.022 | 0.024 | 0.027 |
| 4.819999999999835 | 0.022 | 0.024 | 0.027 |
| 4.824999999999835 | 0.022 | 0.024 | 0.027 |
| 4.829999999999834 | 0.022 | 0.024 | 0.027 |
| 4.834999999999834 | 0.022 | 0.023 | 0.027 |
| 4.839999999999834 | 0.022 | 0.023 | 0.027 |
| 4.844999999999834 | 0.022 | 0.023 | 0.027 |
| 4.849999999999834 | 0.022 | 0.023 | 0.027 |
| 4.854999999999834 | 0.022 | 0.023 | 0.027 |
| 4.859999999999834 | 0.022 | 0.023 | 0.027 |
| 4.864999999999834 | 0.022 | 0.023 | 0.027 |
| 4.869999999999834 | 0.022 | 0.023 | 0.027 |
| 4.874999999999834 | 0.021 | 0.023 | 0.026 |
| 4.879999999999833 | 0.021 | 0.023 | 0.026 |
| 4.884999999999834 | 0.021 | 0.023 | 0.026 |
| 4.889999999999833 | 0.021 | 0.023 | 0.026 |
| 4.894999999999833 | 0.021 | 0.023 | 0.026 |
| 4.899999999999833 | 0.021 | 0.023 | 0.026 |
| 4.904999999999833 | 0.021 | 0.023 | 0.026 |
| 4.909999999999833 | 0.021 | 0.023 | 0.026 |
| 4.914999999999833 | 0.021 | 0.023 | 0.026 |
| 4.919999999999832 | 0.021 | 0.023 | 0.026 |
| 4.924999999999833 | 0.021 | 0.023 | 0.026 |
| 4.929999999999832 | 0.021 | 0.022 | 0.026 |
| 4.934999999999832 | 0.021 | 0.022 | 0.026 |
| 4.939999999999832 | 0.021 | 0.022 | 0.026 |
| 4.944999999999832 | 0.021 | 0.022 | 0.025 |
| 4.949999999999832 | 0.021 | 0.022 | 0.025 |
| 4.954999999999832 | 0.021 | 0.022 | 0.025 |
| 4.959999999999832 | 0.021 | 0.022 | 0.025 |
| 4.964999999999832 | 0.021 | 0.022 | 0.025 |
| 4.969999999999831 | 0.021 | 0.022 | 0.025 |
| 4.974999999999831 | 0.021 | 0.022 | 0.025 |
| 4.97999999999983 | 0.021 | 0.022 | 0.025 |
| 4.984999999999831 | 0.021 | 0.022 | 0.025 |
| 4.98999999999983 | 0.02 | 0.022 | 0.025 |
| 4.994999999999831 | 0.02 | 0.022 | 0.025 |
| 4.99999999999983 | 0.02 | 0.022 | 0.025 |